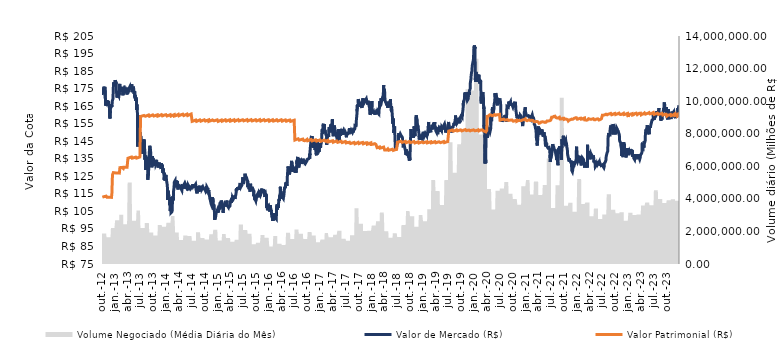
| Category | Valor de Mercado (R$) | Valor Patrimonial (R$) |
|---|---|---|
| 12/28/23 | 165.5 | 158.774 |
| 12/27/23 | 165.5 | 159.761 |
| 12/26/23 | 164.7 | 159.626 |
| 12/22/23 | 162.59 | 159.553 |
| 12/21/23 | 163.9 | 159.491 |
| 12/20/23 | 161.05 | 159.42 |
| 12/19/23 | 160.6 | 159.373 |
| 12/18/23 | 160.11 | 160.405 |
| 12/15/23 | 161 | 160.363 |
| 12/14/23 | 160 | 160.287 |
| 12/13/23 | 159.84 | 160.208 |
| 12/12/23 | 159.7 | 160.079 |
| 12/11/23 | 158.55 | 160.001 |
| 12/8/23 | 159.89 | 159.956 |
| 12/7/23 | 159.9 | 159.929 |
| 12/6/23 | 159.8 | 159.9 |
| 12/5/23 | 159.99 | 159.825 |
| 12/4/23 | 158.18 | 159.766 |
| 12/1/23 | 158 | 159.779 |
| 11/30/23 | 159.5 | 159.713 |
| 11/29/23 | 158.91 | 160.654 |
| 11/28/23 | 158.9 | 160.581 |
| 11/27/23 | 158.52 | 160.512 |
| 11/24/23 | 161 | 160.414 |
| 11/23/23 | 158.65 | 160.365 |
| 11/22/23 | 159.2 | 160.318 |
| 11/21/23 | 161.82 | 160.237 |
| 11/20/23 | 161.82 | 160.236 |
| 11/17/23 | 161.86 | 160.207 |
| 11/16/23 | 161.72 | 160.114 |
| 11/14/23 | 161.01 | 160.028 |
| 11/13/23 | 159.85 | 159.897 |
| 11/10/23 | 161.06 | 159.854 |
| 11/9/23 | 161.88 | 159.764 |
| 11/8/23 | 161.62 | 159.734 |
| 11/7/23 | 162.1 | 159.67 |
| 11/6/23 | 160.15 | 159.549 |
| 11/3/23 | 159.53 | 159.572 |
| 11/1/23 | 157.63 | 159.428 |
| 10/31/23 | 159.68 | 159.304 |
| 10/30/23 | 159.81 | 160.235 |
| 10/27/23 | 160.24 | 160.281 |
| 10/26/23 | 158.55 | 160.322 |
| 10/25/23 | 160.32 | 160.159 |
| 10/24/23 | 159.33 | 160.126 |
| 10/23/23 | 158.78 | 160.027 |
| 10/20/23 | 158.3 | 159.98 |
| 10/19/23 | 157.5 | 159.887 |
| 10/18/23 | 158.56 | 159.935 |
| 10/17/23 | 160 | 159.878 |
| 10/16/23 | 161.43 | 159.902 |
| 10/13/23 | 163.25 | 159.801 |
| 10/11/23 | 161 | 159.818 |
| 10/10/23 | 159.5 | 159.8 |
| 10/9/23 | 157.5 | 159.712 |
| 10/6/23 | 158.23 | 159.58 |
| 10/5/23 | 158.48 | 159.492 |
| 10/4/23 | 158.73 | 159.465 |
| 10/3/23 | 159.04 | 159.354 |
| 10/2/23 | 159.7 | 159.493 |
| 9/29/23 | 164.48 | 159.553 |
| 9/28/23 | 162.7 | 160.42 |
| 9/27/23 | 162.62 | 160.336 |
| 9/26/23 | 162.69 | 160.372 |
| 9/25/23 | 164.4 | 160.416 |
| 9/22/23 | 164.05 | 160.428 |
| 9/21/23 | 163.89 | 160.389 |
| 9/20/23 | 162 | 160.384 |
| 9/19/23 | 164.2 | 160.319 |
| 9/18/23 | 165.75 | 160.315 |
| 9/15/23 | 167.15 | 160.272 |
| 9/14/23 | 162.29 | 160.27 |
| 9/13/23 | 162.98 | 160.23 |
| 9/12/23 | 164.05 | 160.172 |
| 9/11/23 | 163.27 | 160.085 |
| 9/8/23 | 162.5 | 160.02 |
| 9/6/23 | 161.78 | 159.964 |
| 9/5/23 | 161.46 | 159.932 |
| 9/4/23 | 159.89 | 159.942 |
| 9/1/23 | 160.5 | 159.922 |
| 8/31/23 | 160.15 | 159.872 |
| 8/30/23 | 158.99 | 160.836 |
| 8/29/23 | 157.38 | 160.835 |
| 8/28/23 | 159 | 160.843 |
| 8/25/23 | 158.39 | 160.792 |
| 8/24/23 | 158.99 | 160.779 |
| 8/23/23 | 157.49 | 160.732 |
| 8/22/23 | 156.7 | 160.625 |
| 8/21/23 | 157.96 | 160.552 |
| 8/18/23 | 159.5 | 160.555 |
| 8/17/23 | 159.11 | 160.512 |
| 8/16/23 | 159.99 | 160.518 |
| 8/15/23 | 160 | 160.52 |
| 8/14/23 | 159.11 | 160.494 |
| 8/11/23 | 159.63 | 160.513 |
| 8/10/23 | 160.79 | 160.471 |
| 8/9/23 | 161.9 | 160.439 |
| 8/8/23 | 163.89 | 160.43 |
| 8/7/23 | 163.3 | 160.354 |
| 8/4/23 | 162.02 | 160.332 |
| 8/3/23 | 161.85 | 160.269 |
| 8/2/23 | 160.4 | 160.268 |
| 8/1/23 | 161.39 | 160.204 |
| 7/31/23 | 161.25 | 160.163 |
| 7/28/23 | 160.94 | 160.99 |
| 7/27/23 | 160.99 | 160.942 |
| 7/26/23 | 160.65 | 160.956 |
| 7/25/23 | 162.09 | 160.903 |
| 7/24/23 | 162.53 | 160.848 |
| 7/21/23 | 161.8 | 160.772 |
| 7/20/23 | 160.33 | 160.685 |
| 7/19/23 | 160.05 | 160.687 |
| 7/18/23 | 160.61 | 160.677 |
| 7/17/23 | 160 | 160.599 |
| 7/14/23 | 159.74 | 160.544 |
| 7/13/23 | 159.18 | 160.537 |
| 7/12/23 | 159.47 | 160.54 |
| 7/11/23 | 159.4 | 160.469 |
| 7/10/23 | 158.51 | 160.417 |
| 7/7/23 | 158.59 | 160.392 |
| 7/6/23 | 157.9 | 160.267 |
| 7/5/23 | 157.13 | 160.271 |
| 7/4/23 | 156.94 | 160.282 |
| 7/3/23 | 156.78 | 160.282 |
| 6/30/23 | 159.77 | 160.185 |
| 6/29/23 | 160.8 | 161.398 |
| 6/28/23 | 159 | 161.372 |
| 6/27/23 | 157.48 | 161.357 |
| 6/26/23 | 156.97 | 161.311 |
| 6/23/23 | 157.39 | 161.229 |
| 6/22/23 | 156.98 | 161.139 |
| 6/21/23 | 157.47 | 161.092 |
| 6/20/23 | 156.91 | 161.009 |
| 6/19/23 | 156.91 | 160.964 |
| 6/16/23 | 156.39 | 160.916 |
| 6/15/23 | 155.47 | 160.86 |
| 6/14/23 | 155.27 | 160.785 |
| 6/13/23 | 155.9 | 160.715 |
| 6/12/23 | 154.59 | 160.737 |
| 6/9/23 | 154.41 | 160.697 |
| 6/7/23 | 152.65 | 160.61 |
| 6/6/23 | 152.68 | 160.629 |
| 6/5/23 | 153.7 | 160.606 |
| 6/2/23 | 152.59 | 160.498 |
| 6/1/23 | 151.52 | 160.403 |
| 5/31/23 | 152.29 | 160.343 |
| 5/30/23 | 148.98 | 161.32 |
| 5/29/23 | 148.8 | 161.285 |
| 5/26/23 | 148.58 | 161.24 |
| 5/25/23 | 149 | 161.18 |
| 5/24/23 | 150.29 | 161.097 |
| 5/23/23 | 150.35 | 161.021 |
| 5/22/23 | 151.5 | 160.941 |
| 5/19/23 | 153.1 | 160.89 |
| 5/18/23 | 153.55 | 160.87 |
| 5/17/23 | 154.14 | 160.807 |
| 5/16/23 | 153.49 | 160.794 |
| 5/15/23 | 153.48 | 160.817 |
| 5/12/23 | 153.6 | 160.709 |
| 5/11/23 | 151.7 | 160.62 |
| 5/10/23 | 150.05 | 160.504 |
| 5/9/23 | 151.9 | 160.494 |
| 5/8/23 | 150.75 | 160.478 |
| 5/5/23 | 150.7 | 160.484 |
| 5/4/23 | 149.87 | 160.438 |
| 5/3/23 | 147.85 | 160.346 |
| 5/2/23 | 145.45 | 160.234 |
| 4/28/23 | 146 | 160.181 |
| 4/27/23 | 143.83 | 161.155 |
| 4/26/23 | 145 | 161.072 |
| 4/25/23 | 144 | 160.993 |
| 4/24/23 | 141.29 | 160.901 |
| 4/20/23 | 142.43 | 160.727 |
| 4/19/23 | 143.39 | 160.626 |
| 4/18/23 | 142.19 | 160.675 |
| 4/17/23 | 142.37 | 160.65 |
| 4/14/23 | 142.05 | 160.635 |
| 4/13/23 | 143 | 160.602 |
| 4/12/23 | 144.2 | 160.493 |
| 4/11/23 | 139.5 | 160.439 |
| 4/10/23 | 138.98 | 160.302 |
| 4/6/23 | 138 | 160.251 |
| 4/5/23 | 138 | 160.227 |
| 4/4/23 | 137.74 | 160.14 |
| 4/3/23 | 137.62 | 160.049 |
| 3/31/23 | 137.88 | 159.965 |
| 3/30/23 | 137.15 | 161.013 |
| 3/29/23 | 136.72 | 161.218 |
| 3/28/23 | 136.1 | 161.186 |
| 3/27/23 | 135.5 | 161.151 |
| 3/24/23 | 134.69 | 161.071 |
| 3/23/23 | 134.66 | 161 |
| 3/22/23 | 134.9 | 160.975 |
| 3/21/23 | 135.36 | 160.897 |
| 3/20/23 | 135.17 | 160.852 |
| 3/17/23 | 135.7 | 160.789 |
| 3/16/23 | 136 | 160.71 |
| 3/15/23 | 136.85 | 160.667 |
| 3/14/23 | 137.64 | 160.613 |
| 3/13/23 | 134.85 | 160.598 |
| 3/10/23 | 134.62 | 160.453 |
| 3/9/23 | 135.8 | 160.441 |
| 3/8/23 | 135.54 | 160.31 |
| 3/7/23 | 136 | 160.221 |
| 3/6/23 | 135.66 | 160.147 |
| 3/3/23 | 136.57 | 160.077 |
| 3/2/23 | 136.4 | 160.041 |
| 3/1/23 | 136.5 | 160.02 |
| 2/28/23 | 137.26 | 160.009 |
| 2/27/23 | 136 | 161.022 |
| 2/24/23 | 136.94 | 160.896 |
| 2/23/23 | 136.08 | 160.862 |
| 2/22/23 | 137.55 | 160.812 |
| 2/17/23 | 137.76 | 160.766 |
| 2/16/23 | 134.5 | 160.709 |
| 2/15/23 | 134.9 | 160.66 |
| 2/14/23 | 134.95 | 160.532 |
| 2/13/23 | 134.9 | 160.291 |
| 2/10/23 | 135.3 | 160.22 |
| 2/9/23 | 135.5 | 160.151 |
| 2/8/23 | 136.43 | 160.15 |
| 2/7/23 | 136.12 | 160.049 |
| 2/6/23 | 136.5 | 159.992 |
| 2/3/23 | 137.01 | 159.972 |
| 2/2/23 | 136.86 | 159.988 |
| 2/1/23 | 136.14 | 159.922 |
| 1/31/23 | 139.75 | 159.885 |
| 1/30/23 | 139 | 160.756 |
| 1/27/23 | 139.36 | 160.707 |
| 1/26/23 | 139.24 | 160.705 |
| 1/25/23 | 140 | 160.675 |
| 1/24/23 | 139.2 | 160.593 |
| 1/23/23 | 138.97 | 160.51 |
| 1/20/23 | 139.28 | 160.508 |
| 1/19/23 | 139.62 | 160.547 |
| 1/18/23 | 140.44 | 160.512 |
| 1/17/23 | 137.98 | 160.483 |
| 1/16/23 | 138.75 | 160.365 |
| 1/13/23 | 138.8 | 160.378 |
| 1/12/23 | 139.4 | 160.344 |
| 1/11/23 | 139.97 | 160.251 |
| 1/10/23 | 139.55 | 160.148 |
| 1/9/23 | 139.55 | 160.064 |
| 1/6/23 | 137.02 | 160.005 |
| 1/5/23 | 137.32 | 159.905 |
| 1/4/23 | 136.65 | 159.802 |
| 1/3/23 | 139 | 159.8 |
| 1/2/23 | 139.81 | 158.839 |
| 12/29/22 | 140.2 | 159.786 |
| 12/28/22 | 140.98 | 160.853 |
| 12/27/22 | 137.8 | 160.743 |
| 12/26/22 | 138.6 | 160.732 |
| 12/23/22 | 140.94 | 160.706 |
| 12/22/22 | 140.73 | 160.706 |
| 12/21/22 | 139.75 | 160.647 |
| 12/20/22 | 137.86 | 160.633 |
| 12/19/22 | 136.5 | 160.537 |
| 12/16/22 | 135.76 | 160.483 |
| 12/15/22 | 136.6 | 160.488 |
| 12/14/22 | 136.46 | 160.386 |
| 12/13/22 | 137.81 | 160.385 |
| 12/12/22 | 138.75 | 160.388 |
| 12/9/22 | 139.18 | 160.406 |
| 12/8/22 | 139.52 | 160.376 |
| 12/7/22 | 140 | 160.348 |
| 12/6/22 | 141 | 160.282 |
| 12/5/22 | 143.5 | 160.177 |
| 12/2/22 | 144 | 160.203 |
| 12/1/22 | 142.1 | 160.12 |
| 11/30/22 | 144.37 | 160.116 |
| 11/29/22 | 141.75 | 160.924 |
| 11/28/22 | 140 | 160.738 |
| 11/25/22 | 135.94 | 160.637 |
| 11/24/22 | 135.87 | 160.637 |
| 11/23/22 | 137.65 | 160.504 |
| 11/22/22 | 139.46 | 160.518 |
| 11/21/22 | 139.78 | 160.525 |
| 11/18/22 | 140.34 | 160.426 |
| 11/17/22 | 136.6 | 160.415 |
| 11/16/22 | 139.7 | 160.394 |
| 11/14/22 | 140.19 | 160.403 |
| 11/11/22 | 139.68 | 160.245 |
| 11/10/22 | 140.08 | 160.232 |
| 11/9/22 | 142.9 | 160.417 |
| 11/8/22 | 144.17 | 160.384 |
| 11/7/22 | 143.9 | 160.355 |
| 11/4/22 | 144.51 | 160.392 |
| 11/3/22 | 144.8 | 160.327 |
| 11/1/22 | 145.4 | 160.326 |
| 10/31/22 | 147.8 | 160.27 |
| 10/28/22 | 149.22 | 161.02 |
| 10/27/22 | 148.85 | 160.96 |
| 10/26/22 | 149.21 | 160.87 |
| 10/25/22 | 149.34 | 160.85 |
| 10/24/22 | 149.25 | 160.8 |
| 10/21/22 | 150.71 | 160.8 |
| 10/20/22 | 151.2 | 160.73 |
| 10/19/22 | 151.31 | 160.69 |
| 10/18/22 | 150.45 | 160.65 |
| 10/17/22 | 150.69 | 160.58 |
| 10/14/22 | 152.12 | 160.5 |
| 10/13/22 | 151.65 | 160.46 |
| 10/11/22 | 152.34 | 160.42 |
| 10/10/22 | 152.77 | 160.41 |
| 10/7/22 | 151.45 | 160.36 |
| 10/6/22 | 152.55 | 160.31 |
| 10/5/22 | 149.62 | 160.28 |
| 10/4/22 | 148.9 | 160.25 |
| 10/3/22 | 151.05 | 160.2 |
| 9/30/22 | 152.8 | 160.09 |
| 9/29/22 | 151.69 | 160.89 |
| 9/28/22 | 151.38 | 160.83 |
| 9/27/22 | 151.75 | 160.82 |
| 9/26/22 | 151.61 | 160.74 |
| 9/23/22 | 152.34 | 160.76 |
| 9/22/22 | 152.25 | 160.78 |
| 9/21/22 | 153.19 | 160.68 |
| 9/20/22 | 153.99 | 160.59 |
| 9/19/22 | 153.6 | 160.53 |
| 9/16/22 | 154.75 | 160.46 |
| 9/15/22 | 148.91 | 160.38 |
| 9/14/22 | 150.62 | 160.37 |
| 9/13/22 | 151.36 | 160.34 |
| 9/12/22 | 152.01 | 160.35 |
| 9/9/22 | 152.4 | 160.32 |
| 9/8/22 | 151.88 | 160.25 |
| 9/6/22 | 151.6 | 160.11 |
| 9/5/22 | 152.9 | 160.1 |
| 9/2/22 | 151.84 | 160.05 |
| 9/1/22 | 152.59 | 159.99 |
| 8/31/22 | 153.92 | 159.88 |
| 8/30/22 | 153.7 | 160.87 |
| 8/29/22 | 153.18 | 160.83 |
| 8/26/22 | 152.34 | 160.83 |
| 8/25/22 | 150.96 | 160.77 |
| 8/24/22 | 148.49 | 160.78 |
| 8/23/22 | 148.3 | 160.74 |
| 8/22/22 | 148.6 | 160.64 |
| 8/19/22 | 148.35 | 160.61 |
| 8/18/22 | 148.38 | 160.6 |
| 8/17/22 | 148.45 | 160.56 |
| 8/16/22 | 148.48 | 160.56 |
| 8/15/22 | 149.68 | 160.52 |
| 8/12/22 | 147.55 | 160.41 |
| 8/11/22 | 146.89 | 160.32 |
| 8/10/22 | 143 | 160.31 |
| 8/9/22 | 141.37 | 160.26 |
| 8/8/22 | 139.27 | 160.27 |
| 8/5/22 | 139 | 160.14 |
| 8/4/22 | 138.44 | 160.06 |
| 8/3/22 | 138.5 | 159.9 |
| 8/2/22 | 138.86 | 159.81 |
| 8/1/22 | 138.99 | 159.85 |
| 7/29/22 | 136.6 | 159.79 |
| 7/28/22 | 136 | 160.55 |
| 7/27/22 | 134.35 | 160.44 |
| 7/26/22 | 134.38 | 160.37 |
| 7/25/22 | 134 | 160.34 |
| 7/22/22 | 133.09 | 160.28 |
| 7/21/22 | 133.16 | 160.2 |
| 7/20/22 | 133.61 | 160.14 |
| 7/19/22 | 133.1 | 160.06 |
| 7/18/22 | 132.75 | 160.06 |
| 7/15/22 | 132.4 | 160.1 |
| 7/14/22 | 130.53 | 160.04 |
| 7/13/22 | 130.38 | 160.01 |
| 7/12/22 | 129.9 | 159.96 |
| 7/11/22 | 130 | 159.89 |
| 7/8/22 | 130.3 | 159.9 |
| 7/7/22 | 130.57 | 159.9 |
| 7/6/22 | 130.24 | 159.85 |
| 7/5/22 | 130.15 | 159.85 |
| 7/4/22 | 130.96 | 159.83 |
| 7/1/22 | 130.63 | 159.82 |
| 6/30/22 | 131.48 | 159.78 |
| 6/29/22 | 131 | 159.11 |
| 6/28/22 | 131.09 | 159.08 |
| 6/27/22 | 131.12 | 159.15 |
| 6/24/22 | 131 | 157.77 |
| 6/23/22 | 131.15 | 157.84 |
| 6/22/22 | 131.12 | 157.73 |
| 6/21/22 | 131.06 | 157.6 |
| 6/20/22 | 131.11 | 157.57 |
| 6/17/22 | 132 | 157.48 |
| 6/15/22 | 131.64 | 157.35 |
| 6/14/22 | 131.08 | 157.09 |
| 6/13/22 | 131.75 | 157.19 |
| 6/10/22 | 132.93 | 157.26 |
| 6/9/22 | 132.28 | 157.23 |
| 6/8/22 | 133.2 | 157.16 |
| 6/7/22 | 132.8 | 157.1 |
| 6/6/22 | 133.5 | 157.18 |
| 6/3/22 | 132.44 | 157.17 |
| 6/2/22 | 132 | 157.1 |
| 6/1/22 | 132.2 | 157.09 |
| 5/31/22 | 132.6 | 157.13 |
| 5/30/22 | 132.42 | 157.76 |
| 5/27/22 | 131.53 | 157.92 |
| 5/26/22 | 131.7 | 157.87 |
| 5/25/22 | 132 | 157.77 |
| 5/24/22 | 132.18 | 157.78 |
| 5/23/22 | 132 | 157.86 |
| 5/20/22 | 130.76 | 157.61 |
| 5/19/22 | 131.38 | 157.67 |
| 5/18/22 | 131.21 | 157.53 |
| 5/17/22 | 131.04 | 157.49 |
| 5/16/22 | 131.03 | 157.44 |
| 5/13/22 | 131.35 | 157.32 |
| 5/12/22 | 130.52 | 157.25 |
| 5/11/22 | 131.8 | 157.22 |
| 5/10/22 | 131.84 | 157.25 |
| 5/9/22 | 132.5 | 157.17 |
| 5/6/22 | 132.8 | 157.09 |
| 5/5/22 | 134.04 | 157.13 |
| 5/4/22 | 133.5 | 157.25 |
| 5/3/22 | 133 | 157.17 |
| 5/2/22 | 133.7 | 157.13 |
| 4/29/22 | 136.9 | 157.16 |
| 4/28/22 | 135.6 | 157.83 |
| 4/20/22 | 136.12 | 157.66 |
| 4/19/22 | 136.77 | 157.6 |
| 4/18/22 | 137.2 | 157.59 |
| 4/14/22 | 137.46 | 157.49 |
| 4/13/22 | 136.24 | 157.54 |
| 4/12/22 | 135.33 | 157.51 |
| 4/11/22 | 134.7 | 157.4 |
| 4/8/22 | 135.51 | 157.43 |
| 4/7/22 | 135.5 | 157.49 |
| 4/6/22 | 135.45 | 157.5 |
| 4/5/22 | 137.01 | 157.52 |
| 4/4/22 | 137.89 | 157.59 |
| 4/1/22 | 137.62 | 157.47 |
| 3/31/22 | 137.2 | 157.26 |
| 3/30/22 | 137.29 | 157.98 |
| 3/29/22 | 137 | 158.01 |
| 3/28/22 | 136.6 | 157.93 |
| 3/25/22 | 136.46 | 157.83 |
| 3/24/22 | 136.27 | 157.72 |
| 3/23/22 | 136.27 | 157.49 |
| 3/22/22 | 135.96 | 157.45 |
| 3/21/22 | 135.45 | 157.36 |
| 3/18/22 | 143 | 157.3 |
| 3/17/22 | 130 | 157.13 |
| 3/16/22 | 130.5 | 157.04 |
| 3/15/22 | 130.6 | 157.01 |
| 3/14/22 | 130.5 | 156.84 |
| 3/11/22 | 130.8 | 156.97 |
| 3/10/22 | 130.1 | 156.98 |
| 3/9/22 | 130.3 | 157 |
| 3/8/22 | 130.6 | 156.85 |
| 3/7/22 | 131.25 | 156.91 |
| 3/4/22 | 131.97 | 157.08 |
| 3/3/22 | 131.23 | 157.16 |
| 3/2/22 | 131.76 | 157.17 |
| 2/25/22 | 132.85 | 157.19 |
| 2/24/22 | 130 | 158.25 |
| 2/23/22 | 132.17 | 158.26 |
| 2/22/22 | 132.27 | 158.17 |
| 2/21/22 | 132.75 | 158.15 |
| 2/18/22 | 134 | 158.04 |
| 2/17/22 | 134.1 | 158 |
| 2/16/22 | 134.74 | 158.02 |
| 2/15/22 | 134.97 | 157.92 |
| 2/14/22 | 135.2 | 157.8 |
| 2/11/22 | 134.7 | 157.77 |
| 2/10/22 | 134.68 | 157.76 |
| 2/9/22 | 134.5 | 157.76 |
| 2/8/22 | 135.61 | 157.66 |
| 2/7/22 | 135.25 | 157.74 |
| 2/4/22 | 133.94 | 157.65 |
| 2/3/22 | 132.77 | 157.79 |
| 2/2/22 | 132.11 | 157.81 |
| 2/1/22 | 131.22 | 157.69 |
| 1/31/22 | 133.5 | 157.58 |
| 1/28/22 | 132.43 | 158.16 |
| 1/27/22 | 132.88 | 158.11 |
| 1/26/22 | 132.99 | 158.18 |
| 1/25/22 | 134 | 158.06 |
| 1/24/22 | 135.01 | 158.02 |
| 1/21/22 | 136.71 | 157.92 |
| 1/20/22 | 136.72 | 158.02 |
| 1/19/22 | 136.52 | 157.91 |
| 1/18/22 | 136.2 | 157.75 |
| 1/17/22 | 136.15 | 157.74 |
| 1/14/22 | 134.64 | 157.85 |
| 1/13/22 | 133.68 | 157.8 |
| 1/12/22 | 133.73 | 157.75 |
| 1/11/22 | 134.42 | 157.56 |
| 1/10/22 | 134.48 | 157.56 |
| 1/7/22 | 133.53 | 157.57 |
| 1/6/22 | 133.91 | 157.57 |
| 1/5/22 | 134.2 | 157.54 |
| 1/4/22 | 134.07 | 157.56 |
| 1/3/22 | 136.9 | 157.69 |
| 12/30/21 | 141.89 | 157.49 |
| 12/29/21 | 141.27 | 158.32 |
| 12/28/21 | 139.35 | 158.41 |
| 12/27/21 | 134.75 | 158.38 |
| 12/23/21 | 133.52 | 158.31 |
| 12/22/21 | 132.9 | 158.32 |
| 12/21/21 | 133 | 158.32 |
| 12/20/21 | 132.98 | 158.22 |
| 12/17/21 | 133.43 | 158.08 |
| 12/16/21 | 132.01 | 158.13 |
| 12/15/21 | 132.65 | 158.17 |
| 12/14/21 | 132.98 | 158.14 |
| 12/13/21 | 133.59 | 158.05 |
| 12/10/21 | 131.7 | 158.07 |
| 12/9/21 | 130.2 | 157.89 |
| 12/8/21 | 130.78 | 157.79 |
| 12/7/21 | 132 | 157.67 |
| 12/6/21 | 130.8 | 157.6 |
| 12/3/21 | 129.24 | 157.56 |
| 12/2/21 | 128.5 | 157.35 |
| 12/1/21 | 128.2 | 157.24 |
| 11/30/21 | 127.62 | 157.22 |
| 11/29/21 | 127.65 | 157.83 |
| 11/26/21 | 128.28 | 157.72 |
| 11/25/21 | 129.47 | 157.62 |
| 11/24/21 | 130.66 | 157.61 |
| 11/23/21 | 132.95 | 157.55 |
| 11/22/21 | 134 | 157.38 |
| 11/19/21 | 133.5 | 157.43 |
| 11/18/21 | 133 | 157.31 |
| 11/17/21 | 133.12 | 157.3 |
| 11/16/21 | 133.4 | 157.32 |
| 11/12/21 | 133.5 | 157.33 |
| 11/11/21 | 134.17 | 157.3 |
| 11/10/21 | 134.5 | 157.24 |
| 11/9/21 | 135.2 | 157.16 |
| 11/8/21 | 133.48 | 156.97 |
| 11/5/21 | 133.16 | 156.89 |
| 11/4/21 | 133.6 | 156.84 |
| 11/3/21 | 133.5 | 156.87 |
| 11/1/21 | 135.45 | 156.56 |
| 10/29/21 | 135.69 | 156.61 |
| 10/28/21 | 137 | 157.22 |
| 10/27/21 | 137.4 | 157.44 |
| 10/26/21 | 138.1 | 157.37 |
| 10/25/21 | 140.34 | 157.35 |
| 10/22/21 | 140.9 | 157.3 |
| 10/21/21 | 141.82 | 157.24 |
| 10/20/21 | 142.83 | 157.51 |
| 10/19/21 | 142.35 | 157.51 |
| 10/18/21 | 143.98 | 157.77 |
| 10/15/21 | 144 | 157.78 |
| 10/14/21 | 144.99 | 157.8 |
| 10/13/21 | 145.8 | 157.79 |
| 10/11/21 | 145.88 | 157.71 |
| 10/8/21 | 145 | 157.73 |
| 10/7/21 | 144.54 | 157.57 |
| 10/6/21 | 144.89 | 157.6 |
| 10/5/21 | 144.2 | 157.48 |
| 10/4/21 | 144.26 | 157.45 |
| 10/1/21 | 145 | 157.46 |
| 9/30/21 | 147 | 157.34 |
| 9/29/21 | 145.51 | 158.12 |
| 9/28/21 | 146.38 | 158.03 |
| 9/27/21 | 148.15 | 158.04 |
| 9/24/21 | 145.35 | 158.07 |
| 9/23/21 | 145.14 | 158.09 |
| 9/22/21 | 145.88 | 158.17 |
| 9/21/21 | 146 | 158.07 |
| 9/20/21 | 143.1 | 157.87 |
| 9/17/21 | 146.15 | 157.79 |
| 9/16/21 | 141.04 | 157.79 |
| 9/15/21 | 140.45 | 157.75 |
| 9/14/21 | 138.6 | 157.78 |
| 9/13/21 | 134.42 | 157.73 |
| 9/10/21 | 139.6 | 157.63 |
| 9/9/21 | 141.3 | 157.52 |
| 9/8/21 | 141.05 | 157.57 |
| 9/6/21 | 141.35 | 157.7 |
| 9/3/21 | 141.23 | 157.68 |
| 9/2/21 | 141.2 | 157.72 |
| 9/1/21 | 141.17 | 157.84 |
| 8/31/21 | 142.17 | 157.81 |
| 8/30/21 | 141.5 | 158.67 |
| 8/27/21 | 140.58 | 158.6 |
| 8/26/21 | 141.2 | 158.52 |
| 8/25/21 | 139.56 | 158.49 |
| 8/24/21 | 140.4 | 158.31 |
| 8/23/21 | 139.24 | 158.15 |
| 8/20/21 | 133.29 | 158.25 |
| 8/19/21 | 131.3 | 158.09 |
| 8/18/21 | 132.97 | 157.95 |
| 8/17/21 | 132.93 | 158.11 |
| 8/16/21 | 133.57 | 158.08 |
| 8/13/21 | 133.5 | 158.19 |
| 8/12/21 | 135 | 158.27 |
| 8/11/21 | 134.42 | 158.33 |
| 8/10/21 | 134.6 | 158.32 |
| 8/9/21 | 135.46 | 158.25 |
| 8/6/21 | 135.75 | 158.33 |
| 8/5/21 | 134.9 | 158.32 |
| 8/4/21 | 137.63 | 158.52 |
| 8/3/21 | 137.7 | 158.47 |
| 8/2/21 | 139.29 | 158.46 |
| 7/30/21 | 140.37 | 158.42 |
| 7/29/21 | 139.8 | 159.3 |
| 7/28/21 | 139.75 | 159.26 |
| 7/27/21 | 140 | 159.22 |
| 7/26/21 | 139.81 | 159.22 |
| 7/23/21 | 140.1 | 159.14 |
| 7/22/21 | 140.88 | 159.21 |
| 7/21/21 | 141.53 | 159.16 |
| 7/20/21 | 141.99 | 159.12 |
| 7/19/21 | 142.02 | 159.05 |
| 7/16/21 | 142.02 | 159.02 |
| 7/15/21 | 142.35 | 158.93 |
| 7/14/21 | 142.1 | 158.91 |
| 7/13/21 | 143.4 | 158.72 |
| 7/12/21 | 141 | 158.75 |
| 7/8/21 | 139 | 158.72 |
| 7/7/21 | 138.8 | 158.7 |
| 7/6/21 | 137.85 | 158.61 |
| 7/5/21 | 137.79 | 158.67 |
| 7/2/21 | 138.5 | 158.68 |
| 7/1/21 | 138.9 | 158.64 |
| 6/30/21 | 138.61 | 158.68 |
| 6/29/21 | 137.02 | 157.03 |
| 6/28/21 | 134.79 | 156.96 |
| 6/25/21 | 133.19 | 156.84 |
| 6/24/21 | 137.1 | 156.81 |
| 6/23/21 | 137.1 | 156.67 |
| 6/22/21 | 138.91 | 156.62 |
| 6/21/21 | 140.16 | 156.67 |
| 6/18/21 | 140.57 | 156.51 |
| 6/17/21 | 141.46 | 156.67 |
| 6/16/21 | 141.17 | 156.7 |
| 6/15/21 | 141.53 | 156.73 |
| 6/14/21 | 141.35 | 156.64 |
| 6/11/21 | 141.86 | 156.57 |
| 6/10/21 | 140.9 | 156.6 |
| 6/9/21 | 141.17 | 156.66 |
| 6/8/21 | 141.29 | 156.67 |
| 6/7/21 | 141.5 | 156.64 |
| 6/4/21 | 141.6 | 156.65 |
| 6/2/21 | 141.54 | 156.57 |
| 6/1/21 | 142.26 | 156.09 |
| 5/31/21 | 143.72 | 156.03 |
| 5/28/21 | 143.27 | 156.06 |
| 5/27/21 | 142.02 | 155.88 |
| 5/26/21 | 142.4 | 155.83 |
| 5/25/21 | 144.8 | 155.8 |
| 5/24/21 | 145.48 | 155.75 |
| 5/21/21 | 145.2 | 155.8 |
| 5/20/21 | 144.87 | 155.78 |
| 5/19/21 | 145.1 | 155.74 |
| 5/18/21 | 147.02 | 155.77 |
| 5/17/21 | 147.8 | 155.87 |
| 5/14/21 | 149.01 | 155.83 |
| 5/13/21 | 149.14 | 155.85 |
| 5/12/21 | 150.23 | 155.84 |
| 5/11/21 | 149.99 | 155.94 |
| 5/10/21 | 148.43 | 155.92 |
| 5/7/21 | 147.6 | 155.96 |
| 5/6/21 | 147.84 | 155.94 |
| 5/5/21 | 147.5 | 155.99 |
| 5/4/21 | 148.59 | 155.95 |
| 5/3/21 | 148.4 | 156.06 |
| 4/30/21 | 149.15 | 156.11 |
| 4/29/21 | 149.01 | 156.14 |
| 4/28/21 | 151.77 | 156.08 |
| 4/27/21 | 151.47 | 156.05 |
| 4/26/21 | 151.4 | 156.07 |
| 4/23/21 | 150.3 | 156.02 |
| 4/22/21 | 150.01 | 155.92 |
| 4/20/21 | 150.29 | 155.73 |
| 4/19/21 | 150.09 | 155.82 |
| 4/16/21 | 150.81 | 155.68 |
| 4/15/21 | 151.35 | 155.46 |
| 4/14/21 | 151.5 | 155.36 |
| 4/13/21 | 150.89 | 155.27 |
| 4/12/21 | 151 | 155.39 |
| 4/9/21 | 150.18 | 155.34 |
| 4/8/21 | 150.4 | 155.42 |
| 4/7/21 | 150.5 | 155.25 |
| 4/6/21 | 148.5 | 155.34 |
| 4/5/21 | 151.8 | 155.37 |
| 4/1/21 | 153.47 | 155.31 |
| 3/31/21 | 152.73 | 155.32 |
| 3/30/21 | 150 | 156.02 |
| 3/29/21 | 146.57 | 155.89 |
| 3/26/21 | 144.46 | 155.97 |
| 3/25/21 | 142.52 | 155.94 |
| 3/24/21 | 142.4 | 155.89 |
| 3/23/21 | 144 | 156.11 |
| 3/22/21 | 145.38 | 156.25 |
| 3/19/21 | 146.39 | 156.33 |
| 3/18/21 | 147.48 | 156.49 |
| 3/17/21 | 149.66 | 156.39 |
| 3/16/21 | 151.04 | 156.35 |
| 3/15/21 | 151.75 | 156.26 |
| 3/12/21 | 152.44 | 156.15 |
| 3/11/21 | 152.65 | 156.24 |
| 3/10/21 | 152.6 | 156.11 |
| 3/9/21 | 153.99 | 156.12 |
| 3/8/21 | 154.24 | 156.23 |
| 3/5/21 | 154 | 156.4 |
| 3/4/21 | 154.57 | 156.13 |
| 3/3/21 | 155.2 | 155.69 |
| 3/2/21 | 155.75 | 155.88 |
| 3/1/21 | 157.24 | 155.98 |
| 2/26/21 | 158.29 | 156.05 |
| 2/25/21 | 157.9 | 156.68 |
| 2/24/21 | 158.15 | 156.77 |
| 2/23/21 | 157.82 | 156.89 |
| 2/22/21 | 158.15 | 156.81 |
| 2/19/21 | 159.19 | 156.91 |
| 2/18/21 | 158.81 | 156.97 |
| 2/17/21 | 160.01 | 156.89 |
| 2/12/21 | 159.89 | 156.94 |
| 2/11/21 | 158.75 | 156.94 |
| 2/10/21 | 158.39 | 156.94 |
| 2/9/21 | 158.14 | 156.92 |
| 2/8/21 | 158.42 | 156.93 |
| 2/5/21 | 158.5 | 156.92 |
| 2/4/21 | 157.8 | 156.84 |
| 2/3/21 | 158.52 | 156.86 |
| 2/2/21 | 159.79 | 156.83 |
| 2/1/21 | 158.56 | 156.71 |
| 1/29/21 | 159.8 | 156.67 |
| 1/28/21 | 159.43 | 157.23 |
| 1/27/21 | 158.7 | 157.17 |
| 1/26/21 | 159.15 | 157.07 |
| 1/22/21 | 158.71 | 156.87 |
| 1/21/21 | 159.6 | 156.94 |
| 1/20/21 | 160 | 157.03 |
| 1/19/21 | 160 | 157.03 |
| 1/18/21 | 159.8 | 157.03 |
| 1/15/21 | 160.1 | 156.98 |
| 1/14/21 | 160.02 | 156.95 |
| 1/13/21 | 159.44 | 156.77 |
| 1/12/21 | 159.5 | 156.87 |
| 1/11/21 | 159.8 | 156.73 |
| 1/8/21 | 159.55 | 156.84 |
| 1/7/21 | 159.95 | 156.85 |
| 1/6/21 | 159.86 | 157.04 |
| 1/5/21 | 159.8 | 157.16 |
| 1/4/21 | 160.67 | 157.2 |
| 12/30/20 | 162.32 | 157.12 |
| 12/29/20 | 164.41 | 157.71 |
| 12/28/20 | 162.52 | 157.55 |
| 12/23/20 | 161.69 | 157.52 |
| 12/22/20 | 159.53 | 157.42 |
| 12/21/20 | 158.96 | 157.36 |
| 12/18/20 | 158.6 | 157.32 |
| 12/17/20 | 157.9 | 157.25 |
| 12/16/20 | 158.31 | 157.22 |
| 12/15/20 | 157.78 | 157.25 |
| 12/14/20 | 155 | 157.13 |
| 12/11/20 | 153.63 | 157.16 |
| 12/10/20 | 153.89 | 157.04 |
| 12/9/20 | 155.3 | 156.91 |
| 12/8/20 | 155.86 | 156.94 |
| 12/7/20 | 156.2 | 156.89 |
| 12/4/20 | 157.08 | 156.85 |
| 12/3/20 | 157.72 | 156.83 |
| 12/2/20 | 157.8 | 156.55 |
| 12/1/20 | 158.6 | 156.46 |
| 11/30/20 | 159.25 | 156.28 |
| 11/27/20 | 159.04 | 156.92 |
| 11/26/20 | 158.9 | 156.83 |
| 11/25/20 | 159.59 | 156.74 |
| 11/24/20 | 159.86 | 156.67 |
| 11/23/20 | 159.05 | 156.59 |
| 11/20/20 | 160 | 156.64 |
| 11/19/20 | 159.98 | 156.7 |
| 11/18/20 | 159 | 156.68 |
| 11/17/20 | 158.88 | 156.76 |
| 11/16/20 | 159.9 | 156.71 |
| 11/13/20 | 158.76 | 156.68 |
| 11/12/20 | 158.25 | 156.57 |
| 11/11/20 | 158.5 | 156.63 |
| 11/10/20 | 159.5 | 156.75 |
| 11/9/20 | 158.15 | 156.76 |
| 11/6/20 | 158.44 | 156.65 |
| 11/5/20 | 158.18 | 156.51 |
| 11/4/20 | 158.38 | 156.41 |
| 11/3/20 | 158.32 | 156.3 |
| 11/3/20 | 158.32 | 156.3 |
| 10/30/20 | 158.73 | 156.34 |
| 10/29/20 | 159.49 | 156.93 |
| 10/28/20 | 159.7 | 156.92 |
| 10/27/20 | 160.89 | 156.87 |
| 10/26/20 | 160.8 | 156.78 |
| 10/23/20 | 163.24 | 156.73 |
| 10/22/20 | 165.2 | 156.75 |
| 10/21/20 | 166.8 | 156.8 |
| 10/20/20 | 166.97 | 156.8 |
| 10/19/20 | 166.8 | 156.66 |
| 10/16/20 | 166.85 | 156.54 |
| 10/15/20 | 166.85 | 156.52 |
| 10/14/20 | 166.83 | 156.59 |
| 10/13/20 | 166.9 | 156.56 |
| 10/9/20 | 166.65 | 156.44 |
| 10/8/20 | 166.7 | 156.41 |
| 10/7/20 | 166.49 | 156.38 |
| 10/6/20 | 166.45 | 156.36 |
| 10/5/20 | 165.21 | 156.43 |
| 10/2/20 | 166.2 | 156.3 |
| 10/1/20 | 165.62 | 156.33 |
| 9/30/20 | 165.03 | 156.31 |
| 9/29/20 | 165.1 | 156.93 |
| 9/28/20 | 165.06 | 156.94 |
| 9/25/20 | 166 | 157.15 |
| 9/24/20 | 166.67 | 157.12 |
| 9/23/20 | 166.49 | 156.97 |
| 9/22/20 | 166.5 | 157.02 |
| 9/21/20 | 166.02 | 156.91 |
| 9/18/20 | 165.3 | 156.91 |
| 9/17/20 | 166.8 | 157.04 |
| 9/16/20 | 167.5 | 156.95 |
| 9/15/20 | 168 | 156.97 |
| 9/14/20 | 167.1 | 157.01 |
| 9/11/20 | 166.7 | 156.96 |
| 9/10/20 | 166 | 156.94 |
| 9/9/20 | 165.95 | 157.02 |
| 9/8/20 | 166.13 | 156.96 |
| 9/4/20 | 167.61 | 157.02 |
| 9/3/20 | 165.97 | 156.94 |
| 9/2/20 | 165.97 | 156.86 |
| 9/1/20 | 164.97 | 156.87 |
| 8/31/20 | 164.39 | 156.78 |
| 8/28/20 | 164.5 | 157.43 |
| 8/27/20 | 164.5 | 157.31 |
| 8/26/20 | 164 | 157.26 |
| 8/25/20 | 164.45 | 157.35 |
| 8/24/20 | 164.59 | 157.34 |
| 8/21/20 | 164.89 | 157.26 |
| 8/20/20 | 160.89 | 157.22 |
| 8/19/20 | 160.1 | 157.18 |
| 8/18/20 | 158.2 | 157.22 |
| 8/17/20 | 156.15 | 157.02 |
| 8/14/20 | 159.05 | 157.08 |
| 8/13/20 | 160.03 | 157.04 |
| 8/12/20 | 159.27 | 157.11 |
| 8/11/20 | 159.01 | 157.18 |
| 8/10/20 | 158.67 | 157.2 |
| 8/7/20 | 158.1 | 157.19 |
| 8/6/20 | 157.61 | 157.15 |
| 8/5/20 | 159.69 | 157.12 |
| 8/4/20 | 157.6 | 157.08 |
| 8/3/20 | 157.45 | 157.05 |
| 7/31/20 | 156.82 | 157.02 |
| 7/30/20 | 157.5 | 157.65 |
| 7/29/20 | 157 | 157.62 |
| 7/28/20 | 157 | 157.59 |
| 7/27/20 | 157.15 | 157.57 |
| 7/24/20 | 158.89 | 157.54 |
| 7/23/20 | 159 | 157.52 |
| 7/22/20 | 159 | 157.48 |
| 7/21/20 | 158.98 | 157.46 |
| 7/20/20 | 156.9 | 157.43 |
| 7/17/20 | 156 | 157.4 |
| 7/16/20 | 157.5 | 157.36 |
| 7/15/20 | 157.49 | 157.33 |
| 7/14/20 | 157.3 | 157.3 |
| 7/13/20 | 157.69 | 157.27 |
| 7/10/20 | 158.79 | 157.25 |
| 7/9/20 | 160.5 | 157.14 |
| 7/8/20 | 165 | 157.12 |
| 7/7/20 | 166.36 | 157.09 |
| 7/6/20 | 167.4 | 157.06 |
| 7/3/20 | 167.9 | 157.04 |
| 7/2/20 | 169.45 | 157 |
| 7/1/20 | 169.99 | 156.95 |
| 6/30/20 | 168.94 | 156.9 |
| 6/29/20 | 169.5 | 160.3 |
| 6/26/20 | 169.1 | 160.21 |
| 6/25/20 | 169 | 160.21 |
| 6/24/20 | 167.79 | 160.09 |
| 6/23/20 | 167.6 | 160.12 |
| 6/22/20 | 167.3 | 160.05 |
| 6/19/20 | 167.65 | 160.08 |
| 6/18/20 | 168.63 | 160.03 |
| 6/17/20 | 169 | 160.1 |
| 6/16/20 | 166.31 | 160 |
| 6/15/20 | 165.44 | 160.02 |
| 6/12/20 | 166.66 | 160.08 |
| 6/10/20 | 167.49 | 160.07 |
| 6/9/20 | 168.5 | 159.96 |
| 6/8/20 | 170.5 | 159.94 |
| 6/5/20 | 170.89 | 159.87 |
| 6/4/20 | 171 | 159.87 |
| 6/3/20 | 172.48 | 159.88 |
| 6/2/20 | 171.19 | 159.8 |
| 6/1/20 | 170.5 | 159.69 |
| 5/29/20 | 172.39 | 159.66 |
| 5/28/20 | 170 | 160.33 |
| 5/27/20 | 169.72 | 160.32 |
| 5/26/20 | 167.7 | 160.26 |
| 5/25/20 | 167.3 | 160.2 |
| 5/22/20 | 165.95 | 160.03 |
| 5/21/20 | 163.55 | 159.99 |
| 5/20/20 | 163 | 159.87 |
| 5/19/20 | 163.05 | 159.82 |
| 5/18/20 | 162.4 | 159.76 |
| 5/15/20 | 161.91 | 159.65 |
| 5/14/20 | 160.92 | 159.59 |
| 5/13/20 | 162.7 | 159.51 |
| 5/12/20 | 163.65 | 159.55 |
| 5/11/20 | 164.45 | 159.66 |
| 5/8/20 | 162.5 | 159.66 |
| 5/7/20 | 160 | 159.58 |
| 5/6/20 | 160.25 | 159.64 |
| 5/5/20 | 157 | 159.58 |
| 5/4/20 | 156.4 | 159.54 |
| 4/30/20 | 158.99 | 159.39 |
| 4/29/20 | 160 | 159.97 |
| 4/28/20 | 154.03 | 159.87 |
| 4/27/20 | 152 | 159.51 |
| 4/24/20 | 151.67 | 159.45 |
| 4/23/20 | 152.2 | 159.97 |
| 4/22/20 | 150.22 | 160.09 |
| 4/20/20 | 150.6 | 160.05 |
| 4/17/20 | 151.38 | 159.98 |
| 4/16/20 | 152 | 159.92 |
| 4/15/20 | 149.7 | 159.79 |
| 4/14/20 | 152.75 | 159.71 |
| 4/13/20 | 153.25 | 159.39 |
| 4/9/20 | 153 | 159.56 |
| 4/8/20 | 150.99 | 159.45 |
| 4/7/20 | 151.55 | 159.36 |
| 4/6/20 | 147.8 | 159.29 |
| 4/3/20 | 147.01 | 159.18 |
| 4/2/20 | 149 | 159.26 |
| 4/1/20 | 150.9 | 159.26 |
| 3/31/20 | 154.02 | 159.32 |
| 3/30/20 | 153.05 | 151.04 |
| 3/27/20 | 150.6 | 150.98 |
| 3/26/20 | 151.84 | 150.93 |
| 3/25/20 | 148.9 | 150.66 |
| 3/24/20 | 139 | 150.32 |
| 3/23/20 | 132.5 | 150.2 |
| 3/20/20 | 143.11 | 150.33 |
| 3/19/20 | 139.05 | 150.4 |
| 3/18/20 | 132.33 | 150.35 |
| 3/17/20 | 148.5 | 150.82 |
| 3/16/20 | 150.19 | 150.63 |
| 3/13/20 | 154.27 | 150.52 |
| 3/12/20 | 150.1 | 150.08 |
| 3/11/20 | 163 | 150.57 |
| 3/10/20 | 164.29 | 150.84 |
| 3/9/20 | 163.3 | 150.78 |
| 3/6/20 | 170.49 | 150.96 |
| 3/5/20 | 171.04 | 150.93 |
| 3/4/20 | 171.35 | 150.99 |
| 3/3/20 | 172.95 | 150.94 |
| 3/2/20 | 171 | 150.9 |
| 2/28/20 | 170.95 | 150.77 |
| 2/27/20 | 170.18 | 151.5 |
| 2/26/20 | 169.9 | 151.44 |
| 2/21/20 | 170.42 | 151.47 |
| 2/20/20 | 166.5 | 151.46 |
| 2/19/20 | 166.65 | 151.43 |
| 2/18/20 | 170.49 | 151.39 |
| 2/17/20 | 179.6 | 151.37 |
| 2/14/20 | 178.8 | 151.35 |
| 2/13/20 | 180 | 151.27 |
| 2/12/20 | 179.44 | 151.24 |
| 2/11/20 | 177.9 | 151.19 |
| 2/10/20 | 178.1 | 151.12 |
| 2/7/20 | 180.55 | 151.05 |
| 2/6/20 | 180.45 | 151.04 |
| 2/5/20 | 182.25 | 151.03 |
| 2/4/20 | 182.98 | 150.95 |
| 2/3/20 | 182.66 | 150.9 |
| 1/31/20 | 181.64 | 150.8 |
| 1/30/20 | 180.25 | 151.51 |
| 1/29/20 | 178.85 | 151.48 |
| 1/28/20 | 182.15 | 151.45 |
| 1/27/20 | 180.35 | 151.25 |
| 1/24/20 | 182.03 | 151.22 |
| 1/23/20 | 182.5 | 151.18 |
| 1/22/20 | 183 | 151.19 |
| 1/21/20 | 182 | 151.14 |
| 1/20/20 | 181.95 | 151.1 |
| 1/17/20 | 181.52 | 151.21 |
| 1/16/20 | 182.4 | 151.14 |
| 1/15/20 | 182.3 | 151.16 |
| 1/14/20 | 184.48 | 151.11 |
| 1/13/20 | 183.5 | 151.06 |
| 1/10/20 | 178.9 | 151.07 |
| 1/9/20 | 181 | 151.04 |
| 1/8/20 | 187.5 | 151 |
| 1/7/20 | 198.75 | 150.96 |
| 1/6/20 | 197.98 | 150.94 |
| 1/3/20 | 199.6 | 150.93 |
| 1/2/20 | 199.6 | 150.91 |
| 12/30/19 | 198.18 | 150.84 |
| 12/27/19 | 191.84 | 151.51 |
| 12/26/19 | 192 | 151.48 |
| 12/23/19 | 189.99 | 151.38 |
| 12/20/19 | 190 | 151.32 |
| 12/19/19 | 189.85 | 151.25 |
| 12/18/19 | 188 | 151.27 |
| 12/17/19 | 187.6 | 151.23 |
| 12/16/19 | 185 | 151.24 |
| 12/13/19 | 184.15 | 151.25 |
| 12/12/19 | 184.15 | 151.22 |
| 12/11/19 | 184.4 | 151.18 |
| 12/10/19 | 181.99 | 151.14 |
| 12/9/19 | 180.5 | 151.11 |
| 12/6/19 | 180 | 151.07 |
| 12/5/19 | 178.63 | 151.01 |
| 12/4/19 | 175.61 | 150.99 |
| 12/3/19 | 174.75 | 150.91 |
| 12/2/19 | 174.49 | 150.84 |
| 11/29/19 | 174.9 | 150.81 |
| 11/29/19 | 174.9 | 150.81 |
| 11/28/19 | 173.88 | 151.48 |
| 11/28/19 | 173.88 | 151.48 |
| 11/27/19 | 171.5 | 151.42 |
| 11/26/19 | 173.07 | 151.4 |
| 11/25/19 | 171.55 | 151.38 |
| 11/22/19 | 171 | 151.37 |
| 11/21/19 | 173 | 151.29 |
| 11/19/19 | 172.48 | 151.25 |
| 11/18/19 | 169 | 151.23 |
| 11/14/19 | 168.89 | 151.2 |
| 11/13/19 | 168.28 | 151.16 |
| 11/12/19 | 168.53 | 151.12 |
| 11/11/19 | 169.1 | 151.12 |
| 11/8/19 | 169.43 | 151.08 |
| 11/7/19 | 169.75 | 151.06 |
| 11/6/19 | 169.7 | 151.05 |
| 11/5/19 | 169 | 151.05 |
| 11/4/19 | 172.8 | 151.02 |
| 11/1/19 | 170.5 | 150.99 |
| 10/31/19 | 170 | 150.93 |
| 10/30/19 | 170.66 | 151.64 |
| 10/29/19 | 171.51 | 151.59 |
| 10/28/19 | 172.7 | 151.57 |
| 10/25/19 | 170.97 | 151.52 |
| 10/24/19 | 171.2 | 151.46 |
| 10/23/19 | 169 | 151.45 |
| 10/22/19 | 169.5 | 151.4 |
| 10/21/19 | 168.48 | 151.37 |
| 10/18/19 | 167 | 151.34 |
| 10/17/19 | 168 | 151.32 |
| 10/16/19 | 168.03 | 151.25 |
| 10/15/19 | 165.3 | 151.18 |
| 10/14/19 | 163.5 | 151.18 |
| 10/11/19 | 163 | 151.14 |
| 10/10/19 | 161 | 151.02 |
| 10/9/19 | 159.61 | 150.99 |
| 10/8/19 | 160.4 | 150.96 |
| 10/7/19 | 159 | 150.93 |
| 10/4/19 | 159.5 | 150.9 |
| 10/3/19 | 158.51 | 150.87 |
| 10/2/19 | 159.74 | 150.84 |
| 10/1/19 | 160 | 150.81 |
| 9/30/19 | 160.2 | 150.78 |
| 9/27/19 | 159 | 151.48 |
| 9/26/19 | 158.1 | 151.43 |
| 9/25/19 | 158.85 | 151.41 |
| 9/24/19 | 158 | 151.37 |
| 9/23/19 | 155.75 | 151.35 |
| 9/20/19 | 156.6 | 151.31 |
| 9/19/19 | 156.2 | 151.28 |
| 9/18/19 | 155.8 | 151.24 |
| 9/17/19 | 156.07 | 151.21 |
| 9/16/19 | 156.24 | 151.17 |
| 9/13/19 | 155.76 | 151.14 |
| 9/12/19 | 155.5 | 151.1 |
| 9/11/19 | 155.35 | 151.07 |
| 9/10/19 | 155.78 | 151.04 |
| 9/9/19 | 156.5 | 151 |
| 9/6/19 | 156.4 | 150.97 |
| 9/5/19 | 156.5 | 150.94 |
| 9/4/19 | 156.3 | 150.9 |
| 9/3/19 | 156 | 150.88 |
| 9/2/19 | 155.5 | 150.84 |
| 8/30/19 | 158.2 | 150.81 |
| 8/29/19 | 157.99 | 151.5 |
| 8/28/19 | 158 | 151.35 |
| 8/27/19 | 157.8 | 151.28 |
| 8/26/19 | 157 | 151.23 |
| 8/23/19 | 158.7 | 151.2 |
| 8/22/19 | 158.9 | 151.17 |
| 8/21/19 | 159.7 | 151.14 |
| 8/20/19 | 157.1 | 151.11 |
| 8/19/19 | 156.9 | 151.07 |
| 8/16/19 | 156 | 151.06 |
| 8/15/19 | 155.95 | 151.02 |
| 8/14/19 | 155 | 150.99 |
| 8/13/19 | 154.01 | 150.96 |
| 8/12/19 | 155.4 | 150.93 |
| 8/9/19 | 154.4 | 150.9 |
| 8/8/19 | 154.12 | 150.87 |
| 8/7/19 | 154.49 | 150.84 |
| 8/6/19 | 154.6 | 150.81 |
| 8/5/19 | 153.8 | 150.77 |
| 8/2/19 | 154.1 | 150.75 |
| 8/1/19 | 152.78 | 150.71 |
| 7/31/19 | 153.49 | 150.68 |
| 7/30/19 | 152.85 | 151.39 |
| 7/29/19 | 152.65 | 151.36 |
| 7/26/19 | 152 | 151.29 |
| 7/25/19 | 150.01 | 151.27 |
| 7/24/19 | 152.46 | 151.24 |
| 7/23/19 | 152.2 | 151.22 |
| 7/22/19 | 152.4 | 151.2 |
| 7/19/19 | 152.4 | 151.12 |
| 7/18/19 | 152.5 | 151.1 |
| 7/17/19 | 152.45 | 151.08 |
| 7/16/19 | 152.5 | 151.06 |
| 7/15/19 | 152.5 | 151.03 |
| 7/12/19 | 152.3 | 150.96 |
| 7/11/19 | 151.4 | 150.94 |
| 7/10/19 | 152.47 | 150.92 |
| 7/8/19 | 152.7 | 150.87 |
| 7/5/19 | 152.99 | 150.8 |
| 7/4/19 | 153 | 150.78 |
| 7/3/19 | 156 | 150.76 |
| 7/2/19 | 155 | 150.73 |
| 7/1/19 | 155.5 | 150.71 |
| 6/28/19 | 154.23 | 150.69 |
| 6/27/19 | 152.6 | 144.81 |
| 6/26/19 | 152.87 | 144.78 |
| 6/25/19 | 152.6 | 144.74 |
| 6/24/19 | 152.5 | 144.71 |
| 6/21/19 | 152 | 144.67 |
| 6/19/19 | 151.7 | 144.64 |
| 6/18/19 | 152 | 144.6 |
| 6/17/19 | 151 | 144.56 |
| 6/14/19 | 151 | 144.52 |
| 6/13/19 | 151 | 144.49 |
| 6/12/19 | 150.46 | 144.45 |
| 6/11/19 | 150 | 144.41 |
| 6/10/19 | 152.5 | 144.37 |
| 6/7/19 | 152 | 144.33 |
| 6/6/19 | 152.2 | 144.29 |
| 6/5/19 | 153 | 144.26 |
| 6/4/19 | 154.85 | 144.22 |
| 6/3/19 | 155.39 | 144.18 |
| 5/31/19 | 155 | 144.14 |
| 5/30/19 | 154.39 | 144.86 |
| 5/29/19 | 153.9 | 144.84 |
| 5/28/19 | 152.71 | 144.78 |
| 5/27/19 | 152.38 | 144.74 |
| 5/24/19 | 152.2 | 144.68 |
| 5/23/19 | 151.71 | 144.65 |
| 5/22/19 | 152.5 | 144.61 |
| 5/21/19 | 152.29 | 144.58 |
| 5/20/19 | 152.4 | 144.54 |
| 5/17/19 | 152.2 | 144.49 |
| 5/16/19 | 153.19 | 144.45 |
| 5/15/19 | 151.8 | 144.42 |
| 5/14/19 | 150.99 | 144.38 |
| 5/13/19 | 151.33 | 144.35 |
| 5/10/19 | 151.35 | 144.32 |
| 5/9/19 | 151.38 | 144.28 |
| 5/8/19 | 151.8 | 144.25 |
| 5/7/19 | 151.88 | 144.22 |
| 5/6/19 | 150.22 | 144.18 |
| 5/3/19 | 151.81 | 144.15 |
| 5/2/19 | 152 | 144.13 |
| 4/30/19 | 152.18 | 144.02 |
| 4/29/19 | 151.5 | 144.73 |
| 4/26/19 | 152.6 | 144.7 |
| 4/25/19 | 152.6 | 144.66 |
| 4/24/19 | 152 | 144.63 |
| 4/23/19 | 152.5 | 144.59 |
| 4/22/19 | 152 | 144.56 |
| 4/18/19 | 151.5 | 144.52 |
| 4/17/19 | 150.25 | 144.49 |
| 4/16/19 | 149.01 | 144.45 |
| 4/15/19 | 152.8 | 144.42 |
| 4/12/19 | 151.41 | 144.38 |
| 4/11/19 | 151.85 | 144.35 |
| 4/10/19 | 152 | 144.31 |
| 4/9/19 | 150.98 | 144.28 |
| 4/8/19 | 150.2 | 144.26 |
| 4/5/19 | 149.8 | 144.22 |
| 4/4/19 | 150.11 | 144.19 |
| 4/3/19 | 150.52 | 144.15 |
| 4/2/19 | 151.19 | 144.12 |
| 4/1/19 | 153 | 144.1 |
| 3/29/19 | 152.54 | 144.07 |
| 3/28/19 | 153.5 | 144.77 |
| 3/27/19 | 154 | 144.73 |
| 3/26/19 | 156 | 144.69 |
| 3/25/19 | 153.7 | 144.65 |
| 3/22/19 | 152.93 | 144.62 |
| 3/21/19 | 152.88 | 144.57 |
| 3/20/19 | 152.9 | 144.54 |
| 3/19/19 | 152.75 | 144.49 |
| 3/18/19 | 155.5 | 144.45 |
| 3/15/19 | 154 | 144.4 |
| 3/14/19 | 151.75 | 144.37 |
| 3/13/19 | 151.9 | 144.32 |
| 3/12/19 | 152.2 | 144.28 |
| 3/11/19 | 153 | 144.25 |
| 3/8/19 | 153.4 | 144.2 |
| 3/7/19 | 154.3 | 144.13 |
| 3/6/19 | 153.2 | 144.11 |
| 3/1/19 | 152.75 | 144.07 |
| 2/28/19 | 153 | 144.03 |
| 2/27/19 | 151.55 | 144.7 |
| 2/26/19 | 150.1 | 144.68 |
| 2/25/19 | 150.9 | 144.65 |
| 2/22/19 | 151 | 144.61 |
| 2/21/19 | 151 | 144.57 |
| 2/20/19 | 150.75 | 144.54 |
| 2/19/19 | 151 | 144.51 |
| 2/18/19 | 151 | 144.47 |
| 2/15/19 | 150.5 | 144.45 |
| 2/14/19 | 150.5 | 144.41 |
| 2/13/19 | 151 | 144.38 |
| 2/12/19 | 150.67 | 144.34 |
| 2/11/19 | 155.99 | 144.3 |
| 2/8/19 | 152.5 | 144.26 |
| 2/7/19 | 153 | 144.22 |
| 2/6/19 | 151.6 | 144.18 |
| 2/5/19 | 150.5 | 144.14 |
| 2/4/19 | 149.58 | 144.1 |
| 2/1/19 | 148.65 | 144.07 |
| 1/31/19 | 150.2 | 144.04 |
| 1/30/19 | 148.35 | 144.73 |
| 1/29/19 | 150 | 144.7 |
| 1/28/19 | 148.1 | 144.66 |
| 1/24/19 | 147.85 | 144.6 |
| 1/23/19 | 148.37 | 144.56 |
| 1/22/19 | 148.5 | 144.54 |
| 1/21/19 | 148.15 | 144.51 |
| 1/18/19 | 149.51 | 144.47 |
| 1/17/19 | 149.5 | 144.44 |
| 1/16/19 | 149.5 | 144.41 |
| 1/15/19 | 148.99 | 144.37 |
| 1/14/19 | 148.6 | 144.34 |
| 1/11/19 | 148 | 144.29 |
| 1/10/19 | 147.5 | 144.26 |
| 1/9/19 | 148.81 | 144.22 |
| 1/8/19 | 149.69 | 144.19 |
| 1/7/19 | 149.47 | 144.15 |
| 1/4/19 | 150.4 | 144.12 |
| 1/3/19 | 150.28 | 144.08 |
| 1/2/19 | 148.67 | 144.05 |
| 12/28/18 | 146.22 | 144.68 |
| 12/27/18 | 146 | 144.63 |
| 12/26/18 | 146 | 144.59 |
| 12/21/18 | 147 | 144.5 |
| 12/20/18 | 146.02 | 144.46 |
| 12/19/18 | 145.55 | 144.42 |
| 12/18/18 | 146.99 | 144.37 |
| 12/17/18 | 147.5 | 144.35 |
| 12/14/18 | 147.5 | 144.3 |
| 12/13/18 | 147.12 | 144.26 |
| 12/12/18 | 145.85 | 144.22 |
| 12/11/18 | 147.5 | 144.2 |
| 12/10/18 | 146.76 | 144.15 |
| 12/7/18 | 146.8 | 144.11 |
| 12/6/18 | 146 | 144.06 |
| 12/5/18 | 147.89 | 144.02 |
| 12/4/18 | 149.1 | 143.98 |
| 12/3/18 | 150.1 | 143.98 |
| 11/30/18 | 151.9 | 144 |
| 11/29/18 | 153.49 | 144.69 |
| 11/28/18 | 153.39 | 144.67 |
| 11/27/18 | 153.58 | 144.62 |
| 11/26/18 | 153.95 | 144.58 |
| 11/23/18 | 154.5 | 144.54 |
| 11/22/18 | 155 | 144.5 |
| 11/21/18 | 153.8 | 144.46 |
| 11/19/18 | 157.89 | 144.38 |
| 11/16/18 | 158.9 | 144.34 |
| 11/14/18 | 159.8 | 144.3 |
| 11/13/18 | 151.87 | 144.26 |
| 11/12/18 | 151.99 | 144.22 |
| 11/9/18 | 151 | 144.18 |
| 11/8/18 | 150 | 144.14 |
| 11/7/18 | 148.73 | 144.1 |
| 11/6/18 | 147.85 | 144.06 |
| 11/5/18 | 148.21 | 144.02 |
| 11/1/18 | 150.5 | 143.98 |
| 10/31/18 | 153.5 | 144 |
| 10/30/18 | 152.5 | 144.81 |
| 10/29/18 | 149.6 | 144.78 |
| 10/26/18 | 149.5 | 144.74 |
| 10/25/18 | 146.95 | 144.71 |
| 10/24/18 | 148 | 144.67 |
| 10/23/18 | 149.12 | 144.64 |
| 10/22/18 | 147.96 | 144.6 |
| 10/19/18 | 147.95 | 144.56 |
| 10/18/18 | 147.99 | 144.52 |
| 10/17/18 | 147.65 | 144.49 |
| 10/16/18 | 148.1 | 144.45 |
| 10/15/18 | 148.5 | 144.42 |
| 10/11/18 | 148 | 144.39 |
| 10/10/18 | 149.06 | 144.36 |
| 10/9/18 | 152 | 144.32 |
| 10/8/18 | 148 | 144.29 |
| 10/5/18 | 146.9 | 144.25 |
| 10/4/18 | 143.9 | 144.22 |
| 10/3/18 | 142.9 | 144.18 |
| 10/2/18 | 138 | 144.14 |
| 10/1/18 | 134.2 | 144.12 |
| 9/28/18 | 136 | 144.09 |
| 9/27/18 | 134.04 | 144.85 |
| 9/26/18 | 134.5 | 144.82 |
| 9/25/18 | 134.7 | 144.77 |
| 9/24/18 | 135.36 | 144.73 |
| 9/21/18 | 135.9 | 144.69 |
| 9/20/18 | 136.06 | 144.65 |
| 9/19/18 | 136.98 | 144.61 |
| 9/18/18 | 136.51 | 144.57 |
| 9/17/18 | 137.28 | 144.53 |
| 9/14/18 | 137.25 | 144.49 |
| 9/13/18 | 139 | 144.45 |
| 9/12/18 | 139 | 144.4 |
| 9/11/18 | 136.9 | 144.36 |
| 9/10/18 | 138.95 | 144.32 |
| 9/6/18 | 139.5 | 144.28 |
| 9/5/18 | 140.36 | 144.24 |
| 9/4/18 | 138.6 | 144.2 |
| 9/3/18 | 137.2 | 144.16 |
| 8/31/18 | 139.4 | 144.14 |
| 8/30/18 | 139.88 | 144.92 |
| 8/29/18 | 139.75 | 144.88 |
| 8/28/18 | 139.81 | 144.85 |
| 8/27/18 | 140.5 | 144.82 |
| 8/24/18 | 139.99 | 144.79 |
| 8/23/18 | 140.8 | 144.77 |
| 8/22/18 | 142.45 | 144.74 |
| 8/21/18 | 143.2 | 144.71 |
| 8/20/18 | 143.05 | 144.68 |
| 8/17/18 | 142.87 | 144.65 |
| 8/16/18 | 142.52 | 144.61 |
| 8/15/18 | 141.52 | 144.58 |
| 8/14/18 | 142.8 | 144.55 |
| 8/13/18 | 142.8 | 144.52 |
| 8/10/18 | 143.99 | 144.48 |
| 8/9/18 | 146.7 | 144.45 |
| 8/8/18 | 147.18 | 144.42 |
| 8/7/18 | 147 | 144.39 |
| 8/6/18 | 147.5 | 144.36 |
| 8/3/18 | 146.99 | 144.32 |
| 8/2/18 | 147 | 144.29 |
| 8/1/18 | 147.4 | 144.28 |
| 7/31/18 | 148.13 | 144.25 |
| 7/30/18 | 147.9 | 145.01 |
| 7/27/18 | 147.95 | 144.99 |
| 7/26/18 | 148.49 | 144.95 |
| 7/25/18 | 148.51 | 144.92 |
| 7/24/18 | 149.2 | 144.89 |
| 7/23/18 | 149.5 | 144.85 |
| 7/20/18 | 149.44 | 144.82 |
| 7/19/18 | 148.17 | 144.79 |
| 7/18/18 | 148.7 | 144.75 |
| 7/17/18 | 148.3 | 144.73 |
| 7/16/18 | 148.5 | 144.69 |
| 7/13/18 | 149.61 | 144.66 |
| 7/12/18 | 149.51 | 144.63 |
| 7/11/18 | 150.01 | 144.6 |
| 7/10/18 | 144.6 | 144.56 |
| 7/6/18 | 144.99 | 144.5 |
| 7/5/18 | 144 | 144.46 |
| 7/4/18 | 144.5 | 144.44 |
| 7/3/18 | 144.2 | 144.4 |
| 7/2/18 | 144.9 | 144.36 |
| 6/29/18 | 142.49 | 144.34 |
| 6/28/18 | 141.56 | 140.34 |
| 6/27/18 | 143.1 | 140.34 |
| 6/26/18 | 141.9 | 140.31 |
| 6/25/18 | 141.51 | 140.29 |
| 6/22/18 | 140.89 | 140.26 |
| 6/21/18 | 139.98 | 140.22 |
| 6/20/18 | 140 | 140.19 |
| 6/19/18 | 141.6 | 140.15 |
| 6/18/18 | 143.35 | 140.11 |
| 6/15/18 | 149.99 | 140.08 |
| 6/14/18 | 153.5 | 140.04 |
| 6/13/18 | 153.05 | 140.01 |
| 6/12/18 | 154 | 139.98 |
| 6/11/18 | 151.54 | 139.91 |
| 6/8/18 | 149.69 | 139.87 |
| 6/7/18 | 151.6 | 139.84 |
| 6/6/18 | 156.5 | 139.83 |
| 6/5/18 | 157.95 | 139.8 |
| 6/4/18 | 157 | 139.76 |
| 6/1/18 | 154.99 | 139.73 |
| 5/30/18 | 157.9 | 139.69 |
| 5/29/18 | 158.42 | 140.44 |
| 5/28/18 | 158.15 | 140.38 |
| 5/25/18 | 163.5 | 140.35 |
| 5/24/18 | 163.6 | 140.32 |
| 5/23/18 | 164.98 | 140.3 |
| 5/22/18 | 162 | 140.27 |
| 5/21/18 | 163.53 | 140.24 |
| 5/18/18 | 164.5 | 140.21 |
| 5/17/18 | 165.48 | 140.18 |
| 5/16/18 | 167.5 | 140.14 |
| 5/15/18 | 169 | 140.11 |
| 5/14/18 | 167.51 | 140.08 |
| 5/11/18 | 168 | 140.05 |
| 5/10/18 | 167 | 140.02 |
| 5/9/18 | 165.01 | 139.98 |
| 5/8/18 | 165.15 | 139.95 |
| 5/7/18 | 165.31 | 139.92 |
| 5/4/18 | 166.95 | 139.89 |
| 5/3/18 | 167.7 | 139.86 |
| 5/2/18 | 165.01 | 139.84 |
| 4/30/18 | 167 | 139.8 |
| 4/27/18 | 164 | 140.63 |
| 4/26/18 | 164 | 140.51 |
| 4/25/18 | 163.5 | 140.39 |
| 4/24/18 | 163.5 | 140.27 |
| 4/23/18 | 167 | 140.15 |
| 4/20/18 | 167 | 140.03 |
| 4/19/18 | 167 | 139.91 |
| 4/18/18 | 165.5 | 139.92 |
| 4/17/18 | 166.09 | 139.92 |
| 4/16/18 | 166.5 | 139.92 |
| 4/13/18 | 166.9 | 139.93 |
| 4/12/18 | 166.75 | 139.94 |
| 4/11/18 | 166.9 | 139.94 |
| 4/10/18 | 167.13 | 139.95 |
| 4/9/18 | 167.55 | 139.95 |
| 4/6/18 | 168.8 | 139.95 |
| 4/5/18 | 168.7 | 139.96 |
| 4/4/18 | 173 | 139.96 |
| 4/3/18 | 174.5 | 139.97 |
| 4/2/18 | 172.7 | 139.98 |
| 3/29/18 | 175.3 | 139.99 |
| 3/28/18 | 177 | 141.68 |
| 3/27/18 | 175.4 | 141.65 |
| 3/26/18 | 173 | 141.62 |
| 3/23/18 | 169.09 | 141.59 |
| 3/22/18 | 169.99 | 141.54 |
| 3/21/18 | 169 | 141.51 |
| 3/20/18 | 169.99 | 141.47 |
| 3/19/18 | 168 | 141.39 |
| 3/16/18 | 168.58 | 141.39 |
| 3/15/18 | 168.11 | 141.35 |
| 3/14/18 | 168 | 141.32 |
| 3/13/18 | 168.06 | 141.31 |
| 3/12/18 | 168.5 | 141.27 |
| 3/9/18 | 169.5 | 141.24 |
| 3/8/18 | 168 | 141.2 |
| 3/7/18 | 165.6 | 141.17 |
| 3/6/18 | 165.6 | 141.13 |
| 3/5/18 | 165.6 | 141.1 |
| 3/2/18 | 165 | 141.07 |
| 3/1/18 | 166.45 | 141.03 |
| 2/28/18 | 167.8 | 140.99 |
| 2/27/18 | 165 | 141.76 |
| 2/26/18 | 163.95 | 141.71 |
| 2/23/18 | 163 | 141.67 |
| 2/22/18 | 161.06 | 141.63 |
| 2/21/18 | 161.27 | 141.58 |
| 2/20/18 | 161.4 | 141.54 |
| 2/19/18 | 161.49 | 141.5 |
| 2/16/18 | 161.5 | 141.46 |
| 2/15/18 | 162 | 141.42 |
| 2/14/18 | 161.2 | 141.36 |
| 2/9/18 | 161 | 141.31 |
| 2/8/18 | 161.05 | 141.24 |
| 2/7/18 | 161.5 | 141.2 |
| 2/6/18 | 162 | 141.16 |
| 2/5/18 | 162.31 | 141.12 |
| 2/2/18 | 161 | 141.08 |
| 2/1/18 | 160.5 | 143.18 |
| 1/31/18 | 162 | 143.14 |
| 1/30/18 | 161.5 | 143.74 |
| 1/29/18 | 160.3 | 143.72 |
| 1/26/18 | 160.99 | 143.7 |
| 1/24/18 | 160.23 | 143.62 |
| 1/23/18 | 159.73 | 143.59 |
| 1/22/18 | 160.9 | 143.57 |
| 1/19/18 | 160.97 | 143.53 |
| 1/18/18 | 161.1 | 143.5 |
| 1/17/18 | 161 | 143.47 |
| 1/16/18 | 161.51 | 143.43 |
| 1/15/18 | 160.79 | 143.39 |
| 1/12/18 | 161.75 | 143.37 |
| 1/11/18 | 161.9 | 143.33 |
| 1/10/18 | 162.42 | 143.3 |
| 1/9/18 | 161.27 | 143.26 |
| 1/8/18 | 162.26 | 143.22 |
| 1/5/18 | 162.31 | 143.19 |
| 1/4/18 | 163.99 | 143.15 |
| 1/3/18 | 167.9 | 143.09 |
| 1/2/18 | 164.6 | 143.05 |
| 12/28/17 | 164.5 | 143.19 |
| 12/27/17 | 162.99 | 144.08 |
| 12/26/17 | 161.4 | 144.05 |
| 12/22/17 | 160 | 144.01 |
| 12/21/17 | 160.15 | 143.93 |
| 12/20/17 | 159.8 | 143.88 |
| 12/19/17 | 163.4 | 143.84 |
| 12/18/17 | 163.32 | 143.8 |
| 12/15/17 | 163.39 | 143.75 |
| 12/14/17 | 165.2 | 143.71 |
| 12/13/17 | 166.4 | 143.67 |
| 12/12/17 | 167.5 | 143.62 |
| 12/11/17 | 166.77 | 143.59 |
| 12/8/17 | 167.3 | 143.54 |
| 12/7/17 | 166.2 | 143.49 |
| 12/6/17 | 168 | 143.44 |
| 12/5/17 | 166 | 143.41 |
| 12/4/17 | 165.78 | 143.37 |
| 12/1/17 | 166.31 | 143.31 |
| 11/30/17 | 168 | 143.31 |
| 11/29/17 | 167 | 144.15 |
| 11/28/17 | 167.1 | 144.12 |
| 11/27/17 | 166.97 | 144.08 |
| 11/24/17 | 169.19 | 144.19 |
| 11/23/17 | 169.33 | 144.15 |
| 11/22/17 | 168.8 | 144.12 |
| 11/21/17 | 169 | 144.08 |
| 11/17/17 | 168.28 | 144 |
| 11/16/17 | 168 | 143.97 |
| 11/14/17 | 169.19 | 143.93 |
| 11/13/17 | 167.5 | 143.89 |
| 11/10/17 | 167.2 | 143.86 |
| 11/9/17 | 166.9 | 143.82 |
| 11/8/17 | 167.7 | 143.78 |
| 11/7/17 | 168 | 143.6 |
| 11/6/17 | 168 | 143.54 |
| 11/3/17 | 166.71 | 143.51 |
| 11/1/17 | 168 | 143.47 |
| 10/31/17 | 169.5 | 143.43 |
| 10/30/17 | 168.1 | 144.31 |
| 10/27/17 | 168 | 144.27 |
| 10/26/17 | 167.35 | 144.27 |
| 10/25/17 | 167.4 | 144.23 |
| 10/24/17 | 164 | 144.2 |
| 10/23/17 | 164 | 144.16 |
| 10/20/17 | 165 | 144.12 |
| 10/19/17 | 165.7 | 144.09 |
| 10/18/17 | 165.7 | 144.05 |
| 10/17/17 | 166 | 144.01 |
| 10/16/17 | 166 | 143.97 |
| 10/13/17 | 166.3 | 143.91 |
| 10/11/17 | 166.7 | 143.87 |
| 10/10/17 | 166.4 | 143.83 |
| 10/9/17 | 164.61 | 143.8 |
| 10/6/17 | 166.48 | 143.77 |
| 10/5/17 | 166 | 143.69 |
| 10/4/17 | 166.3 | 143.65 |
| 10/3/17 | 166 | 143.62 |
| 10/2/17 | 167 | 143.58 |
| 9/29/17 | 169.05 | 143.52 |
| 9/28/17 | 166.89 | 144.37 |
| 9/27/17 | 166.03 | 144.3 |
| 9/26/17 | 165.52 | 144.23 |
| 9/25/17 | 164.74 | 144.18 |
| 9/22/17 | 165.84 | 144.14 |
| 9/21/17 | 165.86 | 144.1 |
| 9/20/17 | 165.5 | 144.07 |
| 9/19/17 | 162 | 144.03 |
| 9/18/17 | 159.55 | 143.99 |
| 9/15/17 | 157.8 | 143.96 |
| 9/14/17 | 155.4 | 143.83 |
| 9/13/17 | 154 | 143.8 |
| 9/12/17 | 153.5 | 143.71 |
| 9/11/17 | 153.5 | 143.67 |
| 9/8/17 | 153.6 | 143.63 |
| 9/6/17 | 154 | 143.59 |
| 9/5/17 | 154.1 | 143.55 |
| 9/4/17 | 152.2 | 143.51 |
| 9/1/17 | 152 | 143.47 |
| 8/31/17 | 151.5 | 143.43 |
| 8/30/17 | 152.53 | 144.32 |
| 8/29/17 | 152 | 144.29 |
| 8/28/17 | 151.9 | 144.27 |
| 8/25/17 | 150.35 | 144.23 |
| 8/24/17 | 150.99 | 144.2 |
| 8/23/17 | 150 | 144.16 |
| 8/22/17 | 149.9 | 144.13 |
| 8/21/17 | 150.59 | 144.1 |
| 8/18/17 | 149.97 | 144.06 |
| 8/17/17 | 149.89 | 144.03 |
| 8/16/17 | 150.15 | 143.99 |
| 8/15/17 | 149.7 | 143.95 |
| 8/14/17 | 150 | 143.92 |
| 8/11/17 | 151 | 143.88 |
| 8/10/17 | 150.48 | 143.84 |
| 8/9/17 | 150 | 143.81 |
| 8/8/17 | 150.1 | 143.78 |
| 8/7/17 | 151.5 | 143.74 |
| 8/4/17 | 151 | 143.7 |
| 8/3/17 | 150.95 | 143.67 |
| 8/2/17 | 149.5 | 143.63 |
| 8/1/17 | 151 | 143.6 |
| 7/31/17 | 151.7 | 143.56 |
| 7/28/17 | 151.06 | 144.44 |
| 7/27/17 | 152.45 | 144.4 |
| 7/26/17 | 149.74 | 144.36 |
| 7/25/17 | 149.7 | 144.32 |
| 7/24/17 | 149.34 | 144.29 |
| 7/21/17 | 150.1 | 144.25 |
| 7/20/17 | 149.66 | 144.2 |
| 7/19/17 | 150 | 144.16 |
| 7/18/17 | 149.74 | 144.12 |
| 7/17/17 | 149.5 | 144.07 |
| 7/14/17 | 148.71 | 144.03 |
| 7/13/17 | 149.1 | 144.32 |
| 7/12/17 | 149.8 | 144.28 |
| 7/11/17 | 149 | 144.25 |
| 7/10/17 | 148.69 | 144.21 |
| 7/7/17 | 148.1 | 144.17 |
| 7/6/17 | 147.26 | 144.13 |
| 7/5/17 | 147.5 | 144.09 |
| 7/4/17 | 148.7 | 144.06 |
| 7/3/17 | 149.3 | 144.03 |
| 6/30/17 | 149.3 | 144 |
| 6/29/17 | 150 | 144.85 |
| 6/28/17 | 149.33 | 144.81 |
| 6/27/17 | 150 | 144.77 |
| 6/26/17 | 149.15 | 144.75 |
| 6/23/17 | 148.89 | 144.71 |
| 6/22/17 | 149.12 | 144.67 |
| 6/21/17 | 149.5 | 144.63 |
| 6/20/17 | 148.6 | 144.59 |
| 6/19/17 | 150.48 | 144.56 |
| 6/16/17 | 148.7 | 144.52 |
| 6/14/17 | 149 | 144.48 |
| 6/13/17 | 149.35 | 144.45 |
| 6/12/17 | 149 | 144.4 |
| 6/9/17 | 149.95 | 144.36 |
| 6/8/17 | 149 | 144.33 |
| 6/7/17 | 149.31 | 144.29 |
| 6/6/17 | 149.51 | 144.25 |
| 6/5/17 | 149.61 | 144.22 |
| 6/2/17 | 152 | 144.18 |
| 6/1/17 | 151.5 | 144.14 |
| 5/31/17 | 151.02 | 144.11 |
| 5/30/17 | 151 | 144.99 |
| 5/29/17 | 151 | 144.95 |
| 5/26/17 | 150 | 144.92 |
| 5/25/17 | 149 | 144.89 |
| 5/24/17 | 150 | 144.86 |
| 5/23/17 | 149.7 | 144.83 |
| 5/22/17 | 148 | 144.79 |
| 5/19/17 | 149.9 | 144.76 |
| 5/18/17 | 146 | 144.71 |
| 5/17/17 | 151.49 | 144.69 |
| 5/16/17 | 150.9 | 144.65 |
| 5/15/17 | 150.8 | 144.62 |
| 5/12/17 | 151.8 | 144.58 |
| 5/11/17 | 149.6 | 144.55 |
| 5/10/17 | 151.85 | 144.51 |
| 5/9/17 | 150.49 | 144.47 |
| 5/8/17 | 150.46 | 144.43 |
| 5/5/17 | 150 | 144.4 |
| 5/4/17 | 144.92 | 144.37 |
| 5/3/17 | 145 | 144.33 |
| 5/2/17 | 146 | 144.3 |
| 4/28/17 | 146.51 | 144.27 |
| 4/27/17 | 146 | 145.15 |
| 4/26/17 | 147.9 | 145.11 |
| 4/25/17 | 147.51 | 145.06 |
| 4/24/17 | 149.13 | 145.02 |
| 4/20/17 | 150 | 144.98 |
| 4/19/17 | 149 | 144.93 |
| 4/18/17 | 150.5 | 144.89 |
| 4/17/17 | 150.66 | 144.84 |
| 4/13/17 | 153 | 144.8 |
| 4/12/17 | 153.95 | 144.76 |
| 4/11/17 | 150 | 144.72 |
| 4/10/17 | 152.8 | 144.67 |
| 4/7/17 | 152.6 | 144.62 |
| 4/6/17 | 151.25 | 144.58 |
| 4/5/17 | 152.01 | 144.52 |
| 4/4/17 | 150.11 | 144.47 |
| 4/3/17 | 147.8 | 144.43 |
| 3/31/17 | 153.99 | 144.38 |
| 3/30/17 | 151.5 | 145.27 |
| 3/29/17 | 150.1 | 145.23 |
| 3/28/17 | 157.5 | 145.22 |
| 3/27/17 | 155.98 | 145.2 |
| 3/24/17 | 155.59 | 145.17 |
| 3/23/17 | 154.8 | 145.13 |
| 3/22/17 | 154.2 | 145.12 |
| 3/21/17 | 154.19 | 145.09 |
| 3/20/17 | 154.4 | 145.05 |
| 3/17/17 | 153.1 | 145.02 |
| 3/16/17 | 154.5 | 144.98 |
| 3/15/17 | 152.3 | 144.95 |
| 3/14/17 | 152.35 | 144.92 |
| 3/13/17 | 153 | 144.89 |
| 3/10/17 | 151.97 | 144.85 |
| 3/9/17 | 150 | 144.82 |
| 3/8/17 | 150.12 | 144.8 |
| 3/7/17 | 150.72 | 144.76 |
| 3/6/17 | 153 | 144.73 |
| 3/3/17 | 150 | 144.7 |
| 3/2/17 | 147.5 | 144.69 |
| 3/1/17 | 148 | 144.65 |
| 2/24/17 | 149 | 144.62 |
| 2/23/17 | 147.51 | 145.49 |
| 2/22/17 | 147 | 145.45 |
| 2/21/17 | 149 | 145.4 |
| 2/20/17 | 146.51 | 145.36 |
| 2/17/17 | 144.5 | 145.31 |
| 2/16/17 | 143.02 | 145.27 |
| 2/15/17 | 147.75 | 145.22 |
| 2/14/17 | 147.31 | 145.18 |
| 2/13/17 | 148 | 145.13 |
| 2/10/17 | 147.49 | 145.09 |
| 2/9/17 | 149 | 145.04 |
| 2/8/17 | 148.5 | 145 |
| 2/7/17 | 148.99 | 144.96 |
| 2/6/17 | 149.52 | 144.92 |
| 2/3/17 | 151.5 | 144.87 |
| 2/2/17 | 151.79 | 144.82 |
| 2/1/17 | 150 | 144.78 |
| 1/31/17 | 154.8 | 144.74 |
| 1/30/17 | 151.9 | 145.63 |
| 1/27/17 | 151.96 | 145.6 |
| 1/26/17 | 151.97 | 145.52 |
| 1/24/17 | 153.9 | 145.45 |
| 1/23/17 | 154.97 | 145.42 |
| 1/20/17 | 153.5 | 145.39 |
| 1/19/17 | 150.54 | 145.35 |
| 1/18/17 | 150 | 145.32 |
| 1/17/17 | 149.1 | 145.29 |
| 1/16/17 | 152 | 145.25 |
| 1/13/17 | 150.5 | 145.22 |
| 1/12/17 | 149.4 | 145.18 |
| 1/11/17 | 147.5 | 145.15 |
| 1/10/17 | 146.02 | 145.11 |
| 1/9/17 | 144.51 | 145.07 |
| 1/6/17 | 143.95 | 145.04 |
| 1/5/17 | 143 | 145 |
| 1/4/17 | 142.94 | 144.97 |
| 1/3/17 | 141.22 | 144.94 |
| 1/2/17 | 141.31 | 144.91 |
| 12/29/16 | 143.5 | 145.76 |
| 12/28/16 | 143 | 145.71 |
| 12/27/16 | 144 | 145.66 |
| 12/26/16 | 141.05 | 145.62 |
| 12/23/16 | 138.9 | 145.59 |
| 12/22/16 | 144 | 145.55 |
| 12/21/16 | 144.5 | 145.51 |
| 12/20/16 | 140.48 | 145.48 |
| 12/19/16 | 141.3 | 145.44 |
| 12/16/16 | 140.95 | 145.39 |
| 12/15/16 | 141.4 | 145.35 |
| 12/14/16 | 138.1 | 145.32 |
| 12/13/16 | 142.5 | 145.28 |
| 12/12/16 | 146 | 145.24 |
| 12/9/16 | 138.57 | 145.21 |
| 12/8/16 | 137.2 | 145.17 |
| 12/7/16 | 137.61 | 145.14 |
| 12/6/16 | 139.88 | 145.1 |
| 12/5/16 | 137 | 145.07 |
| 12/2/16 | 136.8 | 145.03 |
| 12/1/16 | 138.49 | 144.99 |
| 11/30/16 | 139.05 | 144.96 |
| 11/29/16 | 141 | 145.83 |
| 11/28/16 | 140.58 | 145.79 |
| 11/25/16 | 140 | 145.75 |
| 11/24/16 | 141.2 | 145.71 |
| 11/23/16 | 143.5 | 145.67 |
| 11/22/16 | 145.5 | 145.64 |
| 11/21/16 | 143.5 | 145.6 |
| 11/18/16 | 143.48 | 145.55 |
| 11/17/16 | 143.4 | 145.51 |
| 11/16/16 | 141.21 | 145.47 |
| 11/14/16 | 142.8 | 145.46 |
| 11/11/16 | 143.5 | 145.42 |
| 11/10/16 | 141.53 | 145.38 |
| 11/9/16 | 142.4 | 145.34 |
| 11/8/16 | 144.35 | 145.31 |
| 11/7/16 | 144.11 | 145.26 |
| 11/4/16 | 146 | 145.22 |
| 11/3/16 | 148 | 145.18 |
| 11/1/16 | 145 | 145.14 |
| 10/31/16 | 147.99 | 145.1 |
| 10/28/16 | 147.25 | 145.98 |
| 10/27/16 | 146.38 | 145.94 |
| 10/26/16 | 145.01 | 145.91 |
| 10/25/16 | 144.8 | 145.87 |
| 10/24/16 | 143 | 145.83 |
| 10/21/16 | 140.5 | 145.79 |
| 10/20/16 | 140.59 | 145.75 |
| 10/19/16 | 137.1 | 145.71 |
| 10/18/16 | 137.9 | 145.67 |
| 10/17/16 | 135 | 145.63 |
| 10/14/16 | 135.7 | 145.59 |
| 10/13/16 | 135.4 | 145.55 |
| 10/11/16 | 136 | 145.51 |
| 10/10/16 | 135 | 145.46 |
| 10/7/16 | 134.6 | 145.42 |
| 10/6/16 | 134.7 | 145.39 |
| 10/5/16 | 135 | 145.35 |
| 10/4/16 | 134.5 | 145.31 |
| 10/3/16 | 134.65 | 145.27 |
| 9/30/16 | 134.6 | 145.23 |
| 9/29/16 | 134 | 146.06 |
| 9/28/16 | 133.53 | 145.98 |
| 9/27/16 | 133.89 | 145.9 |
| 9/26/16 | 134 | 145.83 |
| 9/23/16 | 134.01 | 145.74 |
| 9/22/16 | 133.02 | 145.65 |
| 9/21/16 | 133.6 | 145.57 |
| 9/20/16 | 133.47 | 145.49 |
| 9/19/16 | 133.7 | 145.41 |
| 9/16/16 | 133.5 | 145.32 |
| 9/15/16 | 133.01 | 145.33 |
| 9/14/16 | 134 | 145.33 |
| 9/13/16 | 132.5 | 145.33 |
| 9/12/16 | 133 | 145.34 |
| 9/9/16 | 133.25 | 145.34 |
| 9/8/16 | 133.87 | 145.34 |
| 9/6/16 | 133.48 | 145.35 |
| 9/5/16 | 133 | 145.35 |
| 9/2/16 | 133.5 | 145.35 |
| 9/1/16 | 133.35 | 145.36 |
| 8/31/16 | 135 | 145.35 |
| 8/30/16 | 133.5 | 146.24 |
| 8/29/16 | 133.99 | 146.23 |
| 8/26/16 | 134.2 | 146.2 |
| 8/25/16 | 132.24 | 146.16 |
| 8/24/16 | 132.37 | 146.13 |
| 8/23/16 | 131.8 | 146.09 |
| 8/22/16 | 133 | 146.04 |
| 8/19/16 | 132 | 146 |
| 8/18/16 | 133.49 | 145.97 |
| 8/17/16 | 134 | 145.94 |
| 8/16/16 | 132.8 | 145.9 |
| 8/15/16 | 132.57 | 145.85 |
| 8/12/16 | 132.98 | 145.81 |
| 8/11/16 | 133.15 | 145.78 |
| 8/10/16 | 135 | 145.74 |
| 8/9/16 | 135.1 | 145.71 |
| 8/8/16 | 132.88 | 145.68 |
| 8/5/16 | 131.65 | 145.64 |
| 8/4/16 | 132 | 145.61 |
| 8/3/16 | 131.5 | 145.6 |
| 8/2/16 | 131.22 | 145.56 |
| 8/1/16 | 130 | 145.52 |
| 7/29/16 | 135.2 | 145.51 |
| 7/28/16 | 134.2 | 146.4 |
| 7/27/16 | 135 | 146.35 |
| 7/26/16 | 134.98 | 146.34 |
| 7/25/16 | 136 | 146.3 |
| 7/22/16 | 135.3 | 146.26 |
| 7/21/16 | 133 | 146.22 |
| 7/20/16 | 132.08 | 146.18 |
| 7/19/16 | 134 | 146.14 |
| 7/18/16 | 130 | 146.1 |
| 7/15/16 | 128.95 | 146.05 |
| 7/14/16 | 127.08 | 146.01 |
| 7/13/16 | 127.08 | 145.97 |
| 7/12/16 | 127.1 | 145.93 |
| 7/11/16 | 126.51 | 145.88 |
| 7/8/16 | 129 | 145.84 |
| 7/7/16 | 128 | 145.81 |
| 7/6/16 | 127.1 | 145.77 |
| 7/5/16 | 128.7 | 145.72 |
| 7/4/16 | 129 | 145.68 |
| 7/1/16 | 129 | 145.65 |
| 6/30/16 | 130.5 | 145.61 |
| 6/29/16 | 130.4 | 156.99 |
| 6/28/16 | 128.8 | 156.95 |
| 6/27/16 | 129 | 156.91 |
| 6/24/16 | 127.5 | 156.89 |
| 6/23/16 | 130 | 156.85 |
| 6/22/16 | 128.05 | 156.81 |
| 6/21/16 | 129 | 156.77 |
| 6/20/16 | 127.57 | 156.73 |
| 6/17/16 | 127.49 | 156.7 |
| 6/16/16 | 129 | 156.66 |
| 6/15/16 | 131.5 | 156.62 |
| 6/14/16 | 130.01 | 156.58 |
| 6/13/16 | 133 | 156.54 |
| 6/10/16 | 133.8 | 156.51 |
| 6/9/16 | 131.4 | 156.47 |
| 6/8/16 | 129.98 | 156.44 |
| 6/7/16 | 130 | 156.39 |
| 6/6/16 | 130.01 | 156.35 |
| 6/3/16 | 127.99 | 156.31 |
| 6/2/16 | 128.38 | 156.27 |
| 6/1/16 | 128.99 | 156.25 |
| 5/31/16 | 127.99 | 156.21 |
| 5/30/16 | 128 | 157.09 |
| 5/27/16 | 126 | 157.05 |
| 5/25/16 | 127 | 157.01 |
| 5/24/16 | 130.5 | 156.97 |
| 5/23/16 | 129 | 156.93 |
| 5/20/16 | 129.98 | 156.9 |
| 5/19/16 | 129.33 | 156.86 |
| 5/18/16 | 129.3 | 156.82 |
| 5/17/16 | 130.5 | 156.78 |
| 5/16/16 | 129.79 | 156.74 |
| 5/13/16 | 129.95 | 156.7 |
| 5/12/16 | 125.75 | 156.66 |
| 5/11/16 | 123.7 | 156.62 |
| 5/10/16 | 121.58 | 156.57 |
| 5/9/16 | 119.55 | 156.53 |
| 5/6/16 | 121.8 | 156.49 |
| 5/5/16 | 119.87 | 156.44 |
| 5/4/16 | 119.99 | 156.4 |
| 5/3/16 | 120.91 | 156.35 |
| 5/2/16 | 121.5 | 156.33 |
| 4/29/16 | 119.82 | 156.29 |
| 4/28/16 | 119.16 | 157.18 |
| 4/27/16 | 119 | 157.15 |
| 4/26/16 | 118.3 | 157.1 |
| 4/25/16 | 118.9 | 157.05 |
| 4/22/16 | 118.98 | 157.01 |
| 4/20/16 | 117.59 | 156.96 |
| 4/19/16 | 117.28 | 156.92 |
| 4/18/16 | 115 | 156.87 |
| 4/15/16 | 113.19 | 156.83 |
| 4/14/16 | 113.37 | 156.78 |
| 4/13/16 | 113.9 | 156.73 |
| 4/12/16 | 112.41 | 156.69 |
| 4/11/16 | 112.01 | 156.64 |
| 4/8/16 | 112.61 | 156.61 |
| 4/7/16 | 112.99 | 156.57 |
| 4/6/16 | 114.3 | 156.53 |
| 4/5/16 | 114.51 | 156.48 |
| 4/4/16 | 115.21 | 156.44 |
| 4/1/16 | 112.1 | 156.4 |
| 3/31/16 | 114.23 | 156.35 |
| 3/30/16 | 113.99 | 157.25 |
| 3/29/16 | 116.49 | 157.22 |
| 3/28/16 | 116 | 157.16 |
| 3/24/16 | 115 | 157.12 |
| 3/23/16 | 119 | 157.08 |
| 3/22/16 | 118 | 157.04 |
| 3/21/16 | 114.92 | 156.97 |
| 3/18/16 | 114.5 | 156.92 |
| 3/17/16 | 113.98 | 156.89 |
| 3/16/16 | 111 | 156.84 |
| 3/15/16 | 111.95 | 156.8 |
| 3/14/16 | 112 | 156.76 |
| 3/11/16 | 111.04 | 156.72 |
| 3/10/16 | 109 | 156.67 |
| 3/9/16 | 108 | 156.64 |
| 3/8/16 | 107 | 156.6 |
| 3/7/16 | 107.6 | 156.58 |
| 3/4/16 | 108.2 | 156.53 |
| 3/3/16 | 106.35 | 156.49 |
| 3/2/16 | 106.99 | 156.45 |
| 3/1/16 | 106.01 | 156.43 |
| 2/29/16 | 108.9 | 156.38 |
| 2/26/16 | 108.99 | 157.26 |
| 2/25/16 | 107 | 157.21 |
| 2/24/16 | 104.95 | 157.16 |
| 2/23/16 | 100.7 | 157.11 |
| 2/22/16 | 100.5 | 157.07 |
| 2/19/16 | 100.95 | 157.02 |
| 2/18/16 | 100.29 | 156.97 |
| 2/17/16 | 100.16 | 156.92 |
| 2/16/16 | 101.4 | 156.87 |
| 2/15/16 | 100.2 | 156.82 |
| 2/12/16 | 102.01 | 156.76 |
| 2/11/16 | 101.7 | 156.71 |
| 2/10/16 | 103.99 | 156.66 |
| 2/5/16 | 101.3 | 156.61 |
| 2/4/16 | 101.25 | 156.57 |
| 2/3/16 | 100.6 | 156.53 |
| 2/2/16 | 99.82 | 156.48 |
| 2/1/16 | 101.3 | 156.43 |
| 1/29/16 | 102 | 156.38 |
| 1/28/16 | 99.6 | 157.25 |
| 1/27/16 | 101.03 | 157.21 |
| 1/26/16 | 101 | 157.16 |
| 1/22/16 | 102.01 | 157.07 |
| 1/21/16 | 102 | 157.02 |
| 1/20/16 | 103.56 | 156.98 |
| 1/19/16 | 104.51 | 156.93 |
| 1/18/16 | 105.95 | 156.88 |
| 1/15/16 | 105 | 156.84 |
| 1/14/16 | 106.45 | 156.78 |
| 1/13/16 | 107.5 | 156.74 |
| 1/12/16 | 108.51 | 156.7 |
| 1/11/16 | 106.49 | 156.65 |
| 1/8/16 | 106.5 | 156.6 |
| 1/7/16 | 107.5 | 156.56 |
| 1/6/16 | 108.35 | 156.5 |
| 1/5/16 | 105.01 | 156.46 |
| 1/4/16 | 106 | 156.41 |
| 12/30/15 | 108.35 | 157.27 |
| 12/29/15 | 108 | 157.23 |
| 12/28/15 | 108.5 | 157.19 |
| 12/23/15 | 107.74 | 157.11 |
| 12/22/15 | 105.65 | 157.07 |
| 12/21/15 | 106.5 | 157.07 |
| 12/18/15 | 108.01 | 157.03 |
| 12/17/15 | 107.05 | 156.99 |
| 12/16/15 | 108 | 156.95 |
| 12/15/15 | 114 | 156.91 |
| 12/14/15 | 114.5 | 156.86 |
| 12/11/15 | 114.98 | 156.82 |
| 12/10/15 | 113.94 | 156.78 |
| 12/9/15 | 114.3 | 156.74 |
| 12/8/15 | 115 | 156.7 |
| 12/7/15 | 114.72 | 156.66 |
| 12/4/15 | 114.39 | 156.62 |
| 12/3/15 | 113.2 | 156.57 |
| 12/2/15 | 113.98 | 156.53 |
| 12/1/15 | 115.05 | 156.48 |
| 11/30/15 | 117 | 156.44 |
| 11/27/15 | 116.05 | 157.31 |
| 11/26/15 | 115.46 | 157.27 |
| 11/25/15 | 117.44 | 157.22 |
| 11/24/15 | 115.7 | 157.18 |
| 11/23/15 | 116.49 | 157.13 |
| 11/19/15 | 117.69 | 157.04 |
| 11/18/15 | 117 | 157 |
| 11/17/15 | 117 | 156.94 |
| 11/16/15 | 117 | 156.9 |
| 11/13/15 | 116.3 | 156.85 |
| 11/12/15 | 117 | 156.81 |
| 11/11/15 | 118 | 156.76 |
| 11/10/15 | 118.5 | 156.72 |
| 11/9/15 | 116 | 156.67 |
| 11/6/15 | 116.9 | 156.63 |
| 11/5/15 | 116 | 156.59 |
| 11/4/15 | 116 | 156.53 |
| 11/3/15 | 115.5 | 156.49 |
| 10/30/15 | 117 | 156.44 |
| 10/29/15 | 117 | 157.33 |
| 10/28/15 | 114.75 | 157.28 |
| 10/27/15 | 114.5 | 157.24 |
| 10/26/15 | 114.95 | 157.19 |
| 10/23/15 | 115.5 | 157.14 |
| 10/22/15 | 115 | 157.1 |
| 10/21/15 | 114.7 | 157.05 |
| 10/20/15 | 115 | 157.01 |
| 10/19/15 | 113 | 156.96 |
| 10/16/15 | 114 | 156.92 |
| 10/15/15 | 115.24 | 156.87 |
| 10/14/15 | 115.62 | 156.83 |
| 10/13/15 | 115.43 | 156.79 |
| 10/9/15 | 114.3 | 156.74 |
| 10/8/15 | 114 | 156.69 |
| 10/7/15 | 113 | 156.66 |
| 10/6/15 | 112.5 | 156.62 |
| 10/5/15 | 113.6 | 156.57 |
| 10/2/15 | 113.8 | 156.53 |
| 10/1/15 | 113.48 | 156.48 |
| 9/30/15 | 111.01 | 156.41 |
| 9/29/15 | 111 | 157.29 |
| 9/28/15 | 111.22 | 157.25 |
| 9/25/15 | 112 | 157.21 |
| 9/24/15 | 111.37 | 157.17 |
| 9/23/15 | 112.51 | 157.13 |
| 9/22/15 | 113.99 | 157.08 |
| 9/21/15 | 112.45 | 157.04 |
| 9/18/15 | 114.5 | 157 |
| 9/17/15 | 114.9 | 156.96 |
| 9/16/15 | 113.8 | 156.91 |
| 9/15/15 | 116.9 | 156.87 |
| 9/14/15 | 116 | 156.83 |
| 9/11/15 | 116.01 | 156.78 |
| 9/10/15 | 116.5 | 156.75 |
| 9/9/15 | 116.3 | 156.71 |
| 9/8/15 | 118 | 156.66 |
| 9/4/15 | 118 | 156.62 |
| 9/3/15 | 119 | 156.58 |
| 9/2/15 | 118.1 | 156.51 |
| 9/1/15 | 116.7 | 156.48 |
| 8/31/15 | 117.85 | 156.43 |
| 8/28/15 | 117.88 | 157.31 |
| 8/27/15 | 118.44 | 157.26 |
| 8/26/15 | 118 | 157.22 |
| 8/25/15 | 118.73 | 157.18 |
| 8/24/15 | 120.8 | 157.14 |
| 8/21/15 | 116.9 | 157.09 |
| 8/20/15 | 116.25 | 157.05 |
| 8/19/15 | 117 | 157.01 |
| 8/18/15 | 117.73 | 156.97 |
| 8/17/15 | 118.45 | 156.92 |
| 8/14/15 | 118.45 | 156.88 |
| 8/13/15 | 117.6 | 156.84 |
| 8/12/15 | 119 | 156.81 |
| 8/11/15 | 118.6 | 156.75 |
| 8/10/15 | 119 | 156.71 |
| 8/7/15 | 118.75 | 156.67 |
| 8/6/15 | 119.07 | 156.63 |
| 8/5/15 | 120 | 156.58 |
| 8/4/15 | 118.8 | 156.54 |
| 8/3/15 | 122.3 | 156.5 |
| 7/31/15 | 122.32 | 156.46 |
| 7/30/15 | 123 | 157.32 |
| 7/29/15 | 123 | 157.28 |
| 7/28/15 | 123 | 157.23 |
| 7/27/15 | 124 | 157.19 |
| 7/24/15 | 124 | 157.16 |
| 7/23/15 | 124 | 157.12 |
| 7/22/15 | 124.2 | 157.08 |
| 7/21/15 | 124.3 | 157.05 |
| 7/20/15 | 124.5 | 157.01 |
| 7/17/15 | 125.8 | 156.98 |
| 7/16/15 | 126.5 | 156.93 |
| 7/15/15 | 124.4 | 156.89 |
| 7/14/15 | 123.01 | 156.85 |
| 7/13/15 | 124 | 156.82 |
| 7/10/15 | 123 | 156.78 |
| 7/8/15 | 123.15 | 156.7 |
| 7/7/15 | 121.44 | 156.66 |
| 7/6/15 | 121.79 | 156.62 |
| 7/3/15 | 120.6 | 156.59 |
| 7/2/15 | 121.8 | 156.54 |
| 7/1/15 | 123.5 | 156.51 |
| 6/30/15 | 124.5 | 156.47 |
| 6/29/15 | 122.25 | 157.25 |
| 6/26/15 | 121.64 | 157.22 |
| 6/25/15 | 121.34 | 157.18 |
| 6/24/15 | 120.2 | 157.14 |
| 6/23/15 | 120 | 157.1 |
| 6/22/15 | 120.35 | 157.05 |
| 6/19/15 | 120 | 157.01 |
| 6/18/15 | 120.24 | 156.97 |
| 6/17/15 | 119.8 | 156.92 |
| 6/16/15 | 118.93 | 156.88 |
| 6/15/15 | 119.4 | 156.83 |
| 6/12/15 | 119.49 | 156.79 |
| 6/11/15 | 121.18 | 156.76 |
| 6/10/15 | 121.22 | 156.71 |
| 6/9/15 | 119.98 | 156.67 |
| 6/8/15 | 119.99 | 156.63 |
| 6/5/15 | 120.5 | 156.58 |
| 6/3/15 | 120.35 | 156.55 |
| 6/2/15 | 118.75 | 156.5 |
| 6/1/15 | 118 | 156.46 |
| 5/29/15 | 118 | 156.41 |
| 5/28/15 | 117.62 | 157.3 |
| 5/27/15 | 117.6 | 157.26 |
| 5/26/15 | 117.6 | 157.21 |
| 5/25/15 | 118 | 157.16 |
| 5/22/15 | 118 | 157.11 |
| 5/21/15 | 118 | 157.06 |
| 5/20/15 | 117.01 | 157.02 |
| 5/19/15 | 116.9 | 156.97 |
| 5/18/15 | 117.06 | 156.92 |
| 5/15/15 | 118.1 | 156.88 |
| 5/14/15 | 116.48 | 156.84 |
| 5/13/15 | 115.71 | 156.79 |
| 5/12/15 | 115 | 156.75 |
| 5/11/15 | 115 | 156.66 |
| 5/8/15 | 115.37 | 156.62 |
| 5/7/15 | 113.2 | 156.57 |
| 5/6/15 | 113.25 | 156.53 |
| 5/5/15 | 112.07 | 156.48 |
| 5/4/15 | 113 | 156.43 |
| 4/30/15 | 114 | 156.39 |
| 4/29/15 | 112.9 | 157.26 |
| 4/28/15 | 112.9 | 157.21 |
| 4/27/15 | 112.4 | 157.17 |
| 4/24/15 | 112.99 | 157.12 |
| 4/23/15 | 112.04 | 157.07 |
| 4/22/15 | 112.1 | 157.02 |
| 4/20/15 | 112.1 | 156.98 |
| 4/17/15 | 113 | 156.93 |
| 4/16/15 | 111.81 | 156.88 |
| 4/15/15 | 112.52 | 156.84 |
| 4/14/15 | 112 | 156.79 |
| 4/13/15 | 112 | 156.74 |
| 4/10/15 | 112 | 156.7 |
| 4/9/15 | 109.9 | 156.65 |
| 4/8/15 | 109.99 | 156.6 |
| 4/7/15 | 111.45 | 156.56 |
| 4/6/15 | 111 | 156.51 |
| 4/2/15 | 110.58 | 156.46 |
| 4/1/15 | 110.2 | 156.42 |
| 3/31/15 | 110.5 | 156.37 |
| 3/30/15 | 108.1 | 157.25 |
| 3/27/15 | 108 | 157.21 |
| 3/26/15 | 108.5 | 157.16 |
| 3/25/15 | 107.99 | 157.12 |
| 3/24/15 | 108.1 | 157.07 |
| 3/23/15 | 107.5 | 157.03 |
| 3/20/15 | 108.5 | 156.98 |
| 3/19/15 | 107.8 | 156.94 |
| 3/18/15 | 108.5 | 156.9 |
| 3/17/15 | 107.59 | 156.86 |
| 3/16/15 | 107.1 | 156.82 |
| 3/13/15 | 108 | 156.78 |
| 3/12/15 | 108.22 | 156.74 |
| 3/11/15 | 108.19 | 156.7 |
| 3/10/15 | 109.1 | 156.65 |
| 3/9/15 | 111.18 | 156.61 |
| 3/6/15 | 111.2 | 156.56 |
| 3/5/15 | 107.8 | 156.53 |
| 3/4/15 | 108.5 | 156.48 |
| 3/3/15 | 110.25 | 156.44 |
| 3/2/15 | 110.25 | 156.4 |
| 2/27/15 | 110.49 | 156.37 |
| 2/26/15 | 110 | 157.24 |
| 2/25/15 | 108.98 | 157.19 |
| 2/24/15 | 109.5 | 157.14 |
| 2/23/15 | 108.03 | 157.08 |
| 2/20/15 | 108.53 | 157.03 |
| 2/19/15 | 108.99 | 156.98 |
| 2/18/15 | 108.5 | 156.93 |
| 2/13/15 | 108.96 | 156.87 |
| 2/12/15 | 107.5 | 156.82 |
| 2/11/15 | 104.9 | 156.77 |
| 2/10/15 | 104.1 | 156.72 |
| 2/9/15 | 105.2 | 156.67 |
| 2/6/15 | 106.5 | 156.61 |
| 2/5/15 | 107.65 | 156.56 |
| 2/4/15 | 108.02 | 156.51 |
| 2/3/15 | 108.15 | 156.46 |
| 2/2/15 | 110 | 156.41 |
| 1/30/15 | 110.12 | 156.35 |
| 1/29/15 | 110.3 | 157.11 |
| 1/28/15 | 111.19 | 157.06 |
| 1/27/15 | 110.3 | 157.02 |
| 1/26/15 | 110.08 | 156.97 |
| 1/23/15 | 110.68 | 156.93 |
| 1/22/15 | 110.5 | 156.88 |
| 1/21/15 | 110 | 156.84 |
| 1/20/15 | 110.85 | 156.79 |
| 1/19/15 | 109.85 | 156.75 |
| 1/16/15 | 109 | 156.7 |
| 1/15/15 | 107.85 | 156.66 |
| 1/14/15 | 106.13 | 156.62 |
| 1/13/15 | 106.37 | 156.57 |
| 1/12/15 | 106.99 | 156.53 |
| 1/9/15 | 105.9 | 156.48 |
| 1/8/15 | 104.5 | 156.44 |
| 1/7/15 | 104 | 156.39 |
| 1/6/15 | 105.75 | 156.35 |
| 1/5/15 | 105.2 | 156.3 |
| 1/2/15 | 104.2 | 156.25 |
| 12/30/14 | 105.65 | 157.2 |
| 12/29/14 | 105.8 | 157.16 |
| 12/26/14 | 105.52 | 157.12 |
| 12/23/14 | 105.89 | 157.05 |
| 12/22/14 | 104.01 | 157 |
| 12/19/14 | 104.05 | 156.96 |
| 12/18/14 | 103.8 | 156.92 |
| 12/17/14 | 101.19 | 156.89 |
| 12/16/14 | 100.64 | 156.83 |
| 12/15/14 | 103 | 156.78 |
| 12/12/14 | 100.19 | 156.73 |
| 12/11/14 | 101.99 | 156.69 |
| 12/10/14 | 103.95 | 156.64 |
| 12/9/14 | 104.49 | 156.62 |
| 12/8/14 | 106.34 | 156.58 |
| 12/5/14 | 109 | 156.54 |
| 12/4/14 | 106 | 156.66 |
| 12/3/14 | 107.55 | 156.45 |
| 12/2/14 | 109.3 | 156.41 |
| 12/1/14 | 110.5 | 156.37 |
| 11/28/14 | 112.49 | 156.33 |
| 11/27/14 | 110.61 | 157.2 |
| 11/26/14 | 113 | 157.15 |
| 11/25/14 | 110 | 157.11 |
| 11/24/14 | 108.9 | 157.06 |
| 11/21/14 | 108.2 | 157.01 |
| 11/19/14 | 108.05 | 156.92 |
| 11/18/14 | 107.96 | 156.88 |
| 11/17/14 | 109 | 156.83 |
| 11/14/14 | 108.81 | 156.78 |
| 11/13/14 | 109.47 | 156.74 |
| 11/12/14 | 109.5 | 156.69 |
| 11/11/14 | 109 | 156.64 |
| 11/10/14 | 111.5 | 156.6 |
| 11/7/14 | 112.4 | 156.55 |
| 11/6/14 | 112.59 | 156.51 |
| 11/5/14 | 113.7 | 156.46 |
| 11/4/14 | 113.3 | 156.41 |
| 11/3/14 | 113.61 | 156.36 |
| 10/31/14 | 117.1 | 156.32 |
| 10/30/14 | 116.92 | 157.2 |
| 10/29/14 | 116.59 | 157.16 |
| 10/28/14 | 116.43 | 157.12 |
| 10/27/14 | 116.98 | 157.08 |
| 10/24/14 | 116.98 | 157.04 |
| 10/23/14 | 118.25 | 157 |
| 10/22/14 | 118.47 | 156.96 |
| 10/21/14 | 117.11 | 156.92 |
| 10/20/14 | 118.4 | 156.94 |
| 10/17/14 | 118 | 156.9 |
| 10/16/14 | 119 | 156.86 |
| 10/15/14 | 118.3 | 156.81 |
| 10/14/14 | 116.8 | 156.77 |
| 10/13/14 | 117.35 | 156.73 |
| 10/10/14 | 117.25 | 156.69 |
| 10/9/14 | 116.5 | 156.65 |
| 10/8/14 | 117.5 | 156.6 |
| 10/7/14 | 117.8 | 156.56 |
| 10/6/14 | 116.9 | 156.52 |
| 10/3/14 | 117.01 | 156.48 |
| 10/2/14 | 117.69 | 156.44 |
| 10/1/14 | 117.59 | 156.4 |
| 9/30/14 | 118 | 156.35 |
| 9/29/14 | 117.45 | 157.23 |
| 9/26/14 | 117.25 | 157.18 |
| 9/25/14 | 117.68 | 157.14 |
| 9/24/14 | 117.8 | 157.08 |
| 9/23/14 | 118.2 | 157.04 |
| 9/22/14 | 118.25 | 157 |
| 9/19/14 | 118.78 | 156.95 |
| 9/18/14 | 118.5 | 156.91 |
| 9/17/14 | 118.93 | 156.86 |
| 9/16/14 | 118.75 | 156.82 |
| 9/15/14 | 118.95 | 156.77 |
| 9/12/14 | 117.75 | 156.74 |
| 9/11/14 | 118.73 | 156.69 |
| 9/10/14 | 119.2 | 156.64 |
| 9/9/14 | 118.36 | 156.6 |
| 9/8/14 | 118.2 | 156.56 |
| 9/5/14 | 118.89 | 156.52 |
| 9/4/14 | 118.94 | 156.47 |
| 9/3/14 | 118 | 156.43 |
| 9/2/14 | 118.25 | 156.38 |
| 9/1/14 | 119.45 | 156.34 |
| 8/29/14 | 118.15 | 156.3 |
| 8/28/14 | 119.6 | 157.17 |
| 8/27/14 | 119.5 | 157.12 |
| 8/26/14 | 118.8 | 157.08 |
| 8/25/14 | 117.8 | 157.03 |
| 8/22/14 | 116.2 | 156.98 |
| 8/21/14 | 118.7 | 156.94 |
| 8/20/14 | 118.75 | 156.89 |
| 8/19/14 | 118.49 | 156.84 |
| 8/18/14 | 118 | 156.8 |
| 8/15/14 | 118.44 | 156.75 |
| 8/14/14 | 117 | 156.7 |
| 8/13/14 | 116.12 | 156.66 |
| 8/12/14 | 117.9 | 156.61 |
| 8/11/14 | 119.5 | 156.56 |
| 8/8/14 | 115.29 | 156.52 |
| 8/7/14 | 115.2 | 156.47 |
| 8/6/14 | 117 | 156.42 |
| 8/5/14 | 116 | 156.37 |
| 8/4/14 | 116.21 | 156.32 |
| 8/1/14 | 118 | 156.27 |
| 7/31/14 | 119.5 | 156.23 |
| 7/30/14 | 120 | 157.1 |
| 7/29/14 | 120.5 | 157.06 |
| 7/28/14 | 120.17 | 157.01 |
| 7/25/14 | 120.5 | 156.97 |
| 7/24/14 | 120 | 156.93 |
| 7/23/14 | 119.97 | 156.89 |
| 7/22/14 | 119.6 | 156.85 |
| 7/21/14 | 119.4 | 156.8 |
| 7/18/14 | 118.83 | 156.76 |
| 7/17/14 | 119.5 | 156.72 |
| 7/16/14 | 118.5 | 156.68 |
| 7/15/14 | 120.21 | 156.62 |
| 7/14/14 | 120 | 156.58 |
| 7/11/14 | 119.51 | 156.54 |
| 7/10/14 | 120.02 | 156.5 |
| 7/8/14 | 120.5 | 156.41 |
| 7/7/14 | 119.5 | 156.38 |
| 7/4/14 | 119.8 | 156.34 |
| 7/3/14 | 119.8 | 156.29 |
| 7/2/14 | 119.25 | 156.25 |
| 7/1/14 | 118.69 | 156.22 |
| 6/30/14 | 118.59 | 156.18 |
| 6/27/14 | 118.9 | 160.52 |
| 6/26/14 | 118.7 | 160.47 |
| 6/25/14 | 118.1 | 160.42 |
| 6/24/14 | 118.62 | 160.37 |
| 6/23/14 | 118.99 | 160.32 |
| 6/20/14 | 119 | 160.27 |
| 6/18/14 | 119 | 160.22 |
| 6/17/14 | 118.85 | 160.18 |
| 6/16/14 | 118.51 | 160.13 |
| 6/13/14 | 119 | 160.08 |
| 6/11/14 | 118.97 | 159.98 |
| 6/10/14 | 119 | 159.93 |
| 6/9/14 | 119.32 | 159.89 |
| 6/6/14 | 120 | 159.84 |
| 6/5/14 | 119 | 159.79 |
| 6/4/14 | 117 | 159.75 |
| 6/3/14 | 117.13 | 159.7 |
| 6/2/14 | 118.7 | 159.65 |
| 5/30/14 | 120 | 159.598 |
| 5/29/14 | 120 | 160.475 |
| 5/28/14 | 119 | 160.427 |
| 5/27/14 | 118.89 | 160.38 |
| 5/26/14 | 118.973 | 160.334 |
| 5/23/14 | 119.766 | 160.287 |
| 5/22/14 | 118.6 | 160.241 |
| 5/21/14 | 119 | 160.194 |
| 5/20/14 | 118.8 | 160.148 |
| 5/19/14 | 118.9 | 160.099 |
| 5/16/14 | 119.2 | 160.056 |
| 5/15/14 | 119.3 | 160.008 |
| 5/14/14 | 118.3 | 159.961 |
| 5/13/14 | 119 | 159.914 |
| 5/12/14 | 118.5 | 159.867 |
| 5/9/14 | 118 | 159.823 |
| 5/8/14 | 118 | 159.775 |
| 5/7/14 | 120.2 | 159.732 |
| 5/6/14 | 120.3 | 159.685 |
| 5/5/14 | 120.19 | 159.642 |
| 5/2/14 | 119.4 | 159.597 |
| 4/30/14 | 119.5 | 159.551 |
| 4/29/14 | 119 | 160.417 |
| 4/28/14 | 119.05 | 160.374 |
| 4/25/14 | 119 | 160.324 |
| 4/24/14 | 119.61 | 160.274 |
| 4/23/14 | 117.815 | 160.226 |
| 4/22/14 | 117 | 160.177 |
| 4/17/14 | 117 | 160.104 |
| 4/16/14 | 117.5 | 160.054 |
| 4/15/14 | 118.11 | 160.005 |
| 4/14/14 | 119.5 | 159.955 |
| 4/11/14 | 119.35 | 159.909 |
| 4/10/14 | 119 | 159.86 |
| 4/9/14 | 119.8 | 159.81 |
| 4/8/14 | 119.8 | 159.76 |
| 4/7/14 | 120 | 159.717 |
| 4/4/14 | 119.2 | 159.667 |
| 4/3/14 | 120 | 159.619 |
| 4/2/14 | 118.5 | 159.569 |
| 4/1/14 | 118.1 | 159.526 |
| 3/31/14 | 118.6 | 159.476 |
| 3/28/14 | 119.449 | 160.336 |
| 3/27/14 | 120.5 | 160.284 |
| 3/26/14 | 119 | 160.233 |
| 3/25/14 | 117.5 | 160.181 |
| 3/24/14 | 119.885 | 160.134 |
| 3/21/14 | 122.3 | 160.082 |
| 3/20/14 | 120 | 159.96 |
| 3/19/14 | 121.5 | 159.909 |
| 3/18/14 | 120 | 159.859 |
| 3/17/14 | 122.48 | 159.808 |
| 3/14/14 | 121.699 | 159.757 |
| 3/13/14 | 122.5 | 159.706 |
| 3/12/14 | 119.99 | 159.656 |
| 3/11/14 | 120 | 159.605 |
| 3/10/14 | 118.7 | 159.555 |
| 3/7/14 | 120 | 159.502 |
| 3/6/14 | 119.9 | 159.451 |
| 3/5/14 | 122.5 | 159.413 |
| 2/28/14 | 122 | 159.364 |
| 2/27/14 | 121.6 | 160.18 |
| 2/26/14 | 120 | 160.132 |
| 2/25/14 | 119.686 | 160.094 |
| 2/24/14 | 118 | 160.046 |
| 2/21/14 | 116 | 160.003 |
| 2/20/14 | 111.4 | 159.958 |
| 2/19/14 | 112.9 | 159.911 |
| 2/18/14 | 111.3 | 159.862 |
| 2/17/14 | 113.5 | 159.813 |
| 2/14/14 | 111.201 | 159.765 |
| 2/13/14 | 108.2 | 159.716 |
| 2/12/14 | 105.502 | 159.669 |
| 2/11/14 | 104.9 | 159.622 |
| 2/10/14 | 104.551 | 159.575 |
| 2/7/14 | 104.597 | 159.526 |
| 2/6/14 | 104.55 | 159.475 |
| 2/5/14 | 104.6 | 159.428 |
| 2/4/14 | 105 | 159.385 |
| 2/3/14 | 104.201 | 159.333 |
| 1/31/14 | 108.8 | 159.288 |
| 1/30/14 | 106.3 | 160.136 |
| 1/29/14 | 105.2 | 160.098 |
| 1/28/14 | 110.5 | 160.045 |
| 1/27/14 | 108.5 | 160.004 |
| 1/24/14 | 111.948 | 159.963 |
| 1/23/14 | 113.2 | 159.921 |
| 1/22/14 | 112.2 | 159.881 |
| 1/21/14 | 113.3 | 159.838 |
| 1/20/14 | 114 | 159.802 |
| 1/17/14 | 115 | 159.763 |
| 1/16/14 | 114.5 | 159.721 |
| 1/15/14 | 116.9 | 159.687 |
| 1/14/14 | 117 | 159.662 |
| 1/13/14 | 116 | 159.621 |
| 1/10/14 | 111.51 | 159.706 |
| 1/9/14 | 118.7 | 159.666 |
| 1/8/14 | 119 | 159.575 |
| 1/7/14 | 120.501 | 159.461 |
| 1/6/14 | 121 | 159.403 |
| 1/3/14 | 122.4 | 159.374 |
| 1/2/14 | 123.4 | 159.332 |
| 12/30/13 | 125.85 | 160.133 |
| 12/27/13 | 125.8 | 160.107 |
| 12/26/13 | 123.75 | 160.065 |
| 12/23/13 | 122.5 | 159.98 |
| 12/20/13 | 125.8 | 159.959 |
| 12/19/13 | 127 | 159.918 |
| 12/18/13 | 123.003 | 160.316 |
| 12/17/13 | 124.1 | 159.834 |
| 12/16/13 | 125.7 | 159.79 |
| 12/13/13 | 125.5 | 159.744 |
| 12/12/13 | 127 | 159.713 |
| 12/11/13 | 128.5 | 159.673 |
| 12/10/13 | 129.449 | 159.629 |
| 12/9/13 | 127 | 159.591 |
| 12/6/13 | 129.488 | 159.546 |
| 12/5/13 | 130.06 | 159.502 |
| 12/4/13 | 131.55 | 159.457 |
| 12/3/13 | 130 | 159.413 |
| 12/2/13 | 129.8 | 159.37 |
| 11/29/13 | 131.798 | 159.329 |
| 11/28/13 | 132.45 | 160.157 |
| 11/27/13 | 129.8 | 160.109 |
| 11/26/13 | 129.4 | 160.063 |
| 11/25/13 | 129.199 | 160.016 |
| 11/22/13 | 130.5 | 159.969 |
| 11/21/13 | 131.5 | 159.926 |
| 11/19/13 | 130.7 | 159.834 |
| 11/18/13 | 130.77 | 159.788 |
| 11/14/13 | 132.5 | 159.735 |
| 11/13/13 | 131.1 | 159.685 |
| 11/12/13 | 132.8 | 159.627 |
| 11/11/13 | 131.2 | 159.583 |
| 11/8/13 | 132 | 159.538 |
| 11/7/13 | 130.5 | 159.505 |
| 11/6/13 | 131.5 | 159.451 |
| 11/5/13 | 130 | 159.407 |
| 11/4/13 | 131.696 | 159.362 |
| 11/1/13 | 131 | 159.321 |
| 10/31/13 | 132.995 | 159.277 |
| 10/30/13 | 132.8 | 160.074 |
| 10/29/13 | 131.801 | 160.037 |
| 10/28/13 | 132.1 | 160 |
| 10/25/13 | 133 | 159.961 |
| 10/24/13 | 134.4 | 159.924 |
| 10/23/13 | 134.4 | 159.888 |
| 10/22/13 | 132.2 | 159.854 |
| 10/21/13 | 131.701 | 159.817 |
| 10/18/13 | 131.5 | 159.78 |
| 10/17/13 | 132 | 159.742 |
| 10/16/13 | 133 | 159.704 |
| 10/15/13 | 133.5 | 159.666 |
| 10/14/13 | 134 | 159.61 |
| 10/11/13 | 132.199 | 159.564 |
| 10/10/13 | 132 | 159.526 |
| 10/9/13 | 134.1 | 159.497 |
| 10/8/13 | 131.51 | 159.459 |
| 10/7/13 | 131.51 | 159.4 |
| 10/4/13 | 132.5 | 159.36 |
| 10/3/13 | 132.5 | 159.322 |
| 10/2/13 | 132.4 | 159.286 |
| 10/1/13 | 131 | 159.248 |
| 9/30/13 | 135.201 | 159.21 |
| 9/27/13 | 134 | 160.024 |
| 9/26/13 | 134.2 | 159.977 |
| 9/25/13 | 136.5 | 159.936 |
| 9/24/13 | 132.3 | 159.894 |
| 9/23/13 | 131 | 159.852 |
| 9/20/13 | 130.1 | 159.814 |
| 9/19/13 | 132.8 | 159.772 |
| 9/18/13 | 131.6 | 159.73 |
| 9/17/13 | 131.05 | 159.689 |
| 9/16/13 | 133.005 | 159.636 |
| 9/13/13 | 133.999 | 159.582 |
| 9/12/13 | 138.5 | 159.545 |
| 9/11/13 | 140 | 159.504 |
| 9/10/13 | 139.5 | 159.463 |
| 9/9/13 | 140.299 | 159.418 |
| 9/6/13 | 142.4 | 159.377 |
| 9/5/13 | 141.2 | 159.317 |
| 9/4/13 | 140.8 | 159.284 |
| 9/3/13 | 140 | 159.243 |
| 9/2/13 | 137.99 | 159.21 |
| 8/30/13 | 135.498 | 159.166 |
| 8/29/13 | 131 | 159.995 |
| 8/28/13 | 127 | 159.955 |
| 8/27/13 | 125.8 | 159.914 |
| 8/26/13 | 125 | 159.873 |
| 8/23/13 | 123.025 | 159.833 |
| 8/22/13 | 126.3 | 159.791 |
| 8/21/13 | 130 | 159.75 |
| 8/20/13 | 131.4 | 159.71 |
| 8/19/13 | 130.1 | 159.669 |
| 8/16/13 | 135 | 159.63 |
| 8/15/13 | 136.1 | 159.566 |
| 8/14/13 | 132.659 | 159.506 |
| 8/13/13 | 132.9 | 159.466 |
| 8/12/13 | 133 | 159.433 |
| 8/9/13 | 134.9 | 159.392 |
| 8/8/13 | 128.6 | 159.352 |
| 8/7/13 | 131 | 159.326 |
| 8/6/13 | 133 | 159.285 |
| 8/5/13 | 137 | 159.245 |
| 8/2/13 | 134.501 | 159.208 |
| 8/1/13 | 139 | 159.16 |
| 7/31/13 | 140 | 159.126 |
| 7/30/13 | 144.5 | 159.763 |
| 7/29/13 | 144.21 | 159.732 |
| 7/26/13 | 146 | 159.699 |
| 7/25/13 | 143.51 | 159.666 |
| 7/24/13 | 145.799 | 159.634 |
| 7/23/13 | 145 | 159.601 |
| 7/22/13 | 142.6 | 159.569 |
| 7/19/13 | 140.8 | 159.536 |
| 7/18/13 | 139.314 | 159.498 |
| 7/17/13 | 137.8 | 159.473 |
| 7/16/13 | 140.5 | 159.44 |
| 7/15/13 | 140.498 | 159.405 |
| 7/12/13 | 141 | 159.372 |
| 7/11/13 | 142 | 159.339 |
| 7/10/13 | 142 | 159.305 |
| 7/8/13 | 143.8 | 159.239 |
| 7/4/13 | 144 | 159.175 |
| 7/3/13 | 148 | 159.144 |
| 7/2/13 | 143.5 | 159.123 |
| 7/1/13 | 149.998 | 159.09 |
| 6/28/13 | 147.9 | 159.058 |
| 6/27/13 | 147.8 | 135.999 |
| 6/26/13 | 149.7 | 135.959 |
| 6/25/13 | 147 | 135.941 |
| 6/24/13 | 142.1 | 135.904 |
| 6/21/13 | 146.5 | 135.866 |
| 6/20/13 | 148.1 | 135.835 |
| 6/19/13 | 155.202 | 135.793 |
| 6/18/13 | 154.105 | 135.755 |
| 6/17/13 | 159.94 | 135.717 |
| 6/14/13 | 155 | 135.68 |
| 6/13/13 | 160 | 135.655 |
| 6/12/13 | 154.6 | 135.617 |
| 6/11/13 | 142 | 135.586 |
| 6/10/13 | 160.15 | 135.542 |
| 6/7/13 | 165.2 | 135.507 |
| 6/6/13 | 166 | 135.485 |
| 6/5/13 | 162.8 | 135.446 |
| 6/4/13 | 165 | 135.408 |
| 6/3/13 | 169 | 135.371 |
| 5/31/13 | 170 | 135.329 |
| 5/29/13 | 169.111 | 135.943 |
| 5/28/13 | 169.3 | 135.912 |
| 5/27/13 | 168.003 | 135.883 |
| 5/24/13 | 171.49 | 135.852 |
| 5/23/13 | 171.4 | 135.823 |
| 5/22/13 | 170.001 | 135.793 |
| 5/21/13 | 173.45 | 135.765 |
| 5/20/13 | 173.5 | 135.736 |
| 5/17/13 | 172.1 | 135.701 |
| 5/16/13 | 173.45 | 135.666 |
| 5/15/13 | 173.11 | 135.631 |
| 5/14/13 | 174.5 | 135.59 |
| 5/13/13 | 176.21 | 135.556 |
| 5/10/13 | 174.55 | 135.521 |
| 5/9/13 | 174 | 135.488 |
| 5/8/13 | 174.598 | 135.452 |
| 5/7/13 | 173.075 | 135.417 |
| 5/6/13 | 173.801 | 135.385 |
| 5/3/13 | 173.001 | 135.349 |
| 5/2/13 | 174.65 | 135.314 |
| 4/30/13 | 177.5 | 135.279 |
| 4/29/13 | 175.693 | 135.976 |
| 4/26/13 | 176.95 | 135.942 |
| 4/25/13 | 176.9 | 135.909 |
| 4/24/13 | 176.89 | 135.874 |
| 4/23/13 | 177 | 135.839 |
| 4/22/13 | 176 | 135.812 |
| 4/19/13 | 176.4 | 135.778 |
| 4/18/13 | 174.5 | 135.66 |
| 4/17/13 | 174 | 135.626 |
| 4/16/13 | 175.998 | 135.592 |
| 4/15/13 | 175.898 | 135.557 |
| 4/12/13 | 175.5 | 135.52 |
| 4/11/13 | 175.2 | 135.489 |
| 4/10/13 | 175 | 135.454 |
| 4/9/13 | 174 | 135.424 |
| 4/8/13 | 174.3 | 135.39 |
| 4/5/13 | 172.999 | 135.357 |
| 4/4/13 | 174.9 | 135.328 |
| 4/3/13 | 173.6 | 135.294 |
| 4/2/13 | 172.25 | 135.261 |
| 4/1/13 | 175.5 | 135.227 |
| 3/28/13 | 171.701 | 130.165 |
| 3/27/13 | 173 | 130.191 |
| 3/26/13 | 173.3 | 130.193 |
| 3/25/13 | 173.3 | 130.195 |
| 3/22/13 | 173.972 | 130.197 |
| 3/21/13 | 173.603 | 130.198 |
| 3/20/13 | 174 | 130.2 |
| 3/19/13 | 172.5 | 130.202 |
| 3/18/13 | 173.9 | 130.196 |
| 3/15/13 | 174.2 | 130.194 |
| 3/14/13 | 174.499 | 130.194 |
| 3/13/13 | 173.8 | 130.193 |
| 3/12/13 | 173.99 | 130.191 |
| 3/11/13 | 173.7 | 130.19 |
| 3/8/13 | 175.5 | 130.189 |
| 3/7/13 | 174.99 | 130.188 |
| 3/6/13 | 174.8 | 130.187 |
| 3/5/13 | 174.8 | 130.186 |
| 3/4/13 | 173 | 130.188 |
| 3/1/13 | 172.2 | 129.478 |
| 2/28/13 | 173 | 130.028 |
| 2/27/13 | 171.22 | 130.031 |
| 2/26/13 | 172 | 130.015 |
| 2/25/13 | 174 | 130.021 |
| 2/22/13 | 173.6 | 130.026 |
| 2/21/13 | 174 | 130.027 |
| 2/20/13 | 173.999 | 130.028 |
| 2/19/13 | 173.101 | 130.03 |
| 2/18/13 | 176 | 130.031 |
| 2/15/13 | 175.6 | 130.032 |
| 2/14/13 | 175.104 | 130.034 |
| 2/13/13 | 175.5 | 130.035 |
| 2/8/13 | 175 | 130.037 |
| 2/7/13 | 174.9 | 130.041 |
| 2/6/13 | 174 | 130.041 |
| 2/5/13 | 174 | 129.937 |
| 2/4/13 | 177.7 | 129.852 |
| 2/1/13 | 178 | 126.828 |
| 1/31/13 | 171.701 | 126.83 |
| 1/30/13 | 172.5 | 126.836 |
| 1/29/13 | 171.998 | 126.845 |
| 1/28/13 | 170.7 | 126.851 |
| 1/24/13 | 171.3 | 126.862 |
| 1/23/13 | 170 | 126.872 |
| 1/22/13 | 169.5 | 126.874 |
| 1/21/13 | 170 | 126.88 |
| 1/18/13 | 170 | 126.886 |
| 1/17/13 | 171 | 126.892 |
| 1/16/13 | 170 | 126.897 |
| 1/15/13 | 170.5 | 126.903 |
| 1/14/13 | 172.4 | 126.91 |
| 1/11/13 | 173 | 126.915 |
| 1/10/13 | 175.5 | 126.922 |
| 1/9/13 | 175.9 | 126.936 |
| 1/8/13 | 179 | 126.928 |
| 1/7/13 | 177.203 | 126.931 |
| 1/4/13 | 177.2 | 126.933 |
| 1/3/13 | 179.9 | 126.944 |
| 1/2/13 | 178.5 | 126.938 |
| 12/28/12 | 178.9 | 127 |
| 12/27/12 | 178.999 | 127.059 |
| 12/26/12 | 178.5 | 127.12 |
| 12/21/12 | 178 | 127.112 |
| 12/20/12 | 174.1 | 127.102 |
| 12/19/12 | 174.001 | 127.097 |
| 12/18/12 | 170.8 | 127.09 |
| 12/17/12 | 169.101 | 127.072 |
| 12/14/12 | 169 | 125.731 |
| 12/13/12 | 167.999 | 123.185 |
| 12/12/12 | 168 | 120.847 |
| 12/11/12 | 167.5 | 118.19 |
| 12/10/12 | 164.6 | 115.343 |
| 12/7/12 | 166 | 112.994 |
| 12/6/12 | 165.84 | 112.993 |
| 12/5/12 | 164.99 | 112.995 |
| 12/4/12 | 165.396 | 112.997 |
| 12/3/12 | 163.9 | 112.999 |
| 11/30/12 | 164.99 | 113.001 |
| 11/29/12 | 162.998 | 113.043 |
| 11/28/12 | 160.999 | 113.045 |
| 11/27/12 | 162.5 | 113.048 |
| 11/26/12 | 158 | 113.051 |
| 11/23/12 | 163 | 113.053 |
| 11/22/12 | 163 | 113.056 |
| 11/21/12 | 165 | 113.05 |
| 11/19/12 | 165.7 | 113.059 |
| 11/16/12 | 168 | 113.056 |
| 11/14/12 | 167.4 | 113.058 |
| 11/13/12 | 166 | 113.064 |
| 11/12/12 | 166 | 113.03 |
| 11/9/12 | 165 | 113.031 |
| 11/8/12 | 164.5 | 113.03 |
| 11/7/12 | 165 | 113.031 |
| 11/6/12 | 165.13 | 113.032 |
| 11/5/12 | 168.5 | 113.032 |
| 11/1/12 | 169 | 113.033 |
| 10/31/12 | 168 | 113.034 |
| 10/30/12 | 165.3 | 113.702 |
| 10/29/12 | 166.5 | 113.671 |
| 10/26/12 | 168 | 113.64 |
| 10/25/12 | 165.51 | 113.61 |
| 10/24/12 | 174 | 113.577 |
| 10/23/12 | 174.45 | 113.547 |
| 10/22/12 | 176 | 113.516 |
| 10/19/12 | 176.5 | 113.485 |
| 10/18/12 | 176.5 | 113.455 |
| 10/17/12 | 174.642 | 113.424 |
| 10/16/12 | 176 | 113.394 |
| 10/15/12 | 176.016 | 113.411 |
| 10/11/12 | 176 | 113.332 |
| 10/10/12 | 174.2 | 113.301 |
| 10/9/12 | 174.1 | 113.27 |
| 10/8/12 | 173.49 | 113.26 |
| 10/5/12 | 172.2 | 113.227 |
| 10/4/12 | 172.2 | 113.14 |
| 10/3/12 | 173.8 | 113.108 |
| 10/2/12 | 174.8 | 113.077 |
| 10/1/12 | 171.3 | 113.046 |